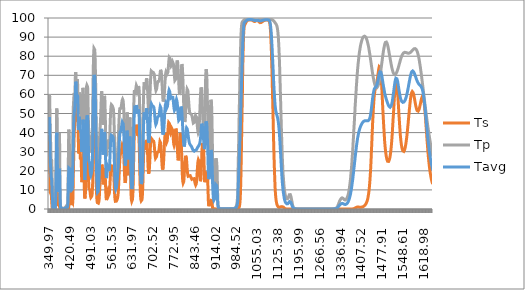
| Category | Ts | Tp | Tavg |
|---|---|---|---|
| 349.97 | 31.555 | 46.765 | 39.16 |
| 350.48 | 37.122 | 53.475 | 45.298 |
| 350.99 | 38.547 | 57.639 | 48.093 |
| 351.5 | 35.73 | 60.073 | 47.901 |
| 352.01 | 29.308 | 58.875 | 44.091 |
| 352.52 | 21.343 | 54.514 | 37.928 |
| 353.02 | 14.359 | 49.915 | 32.137 |
| 353.53 | 10.416 | 45.183 | 27.799 |
| 354.03 | 8.699 | 41.356 | 25.027 |
| 354.53 | 8.532 | 38.668 | 23.6 |
| 355.03 | 8.548 | 36.573 | 22.561 |
| 355.53 | 8.332 | 33.841 | 21.086 |
| 356.03 | 8.072 | 30.277 | 19.175 |
| 356.52 | 7.842 | 27.331 | 17.587 |
| 357.01 | 8.133 | 25.373 | 16.753 |
| 357.51 | 8.057 | 25.013 | 16.535 |
| 358.0 | 7.152 | 25.956 | 16.554 |
| 358.49 | 5.267 | 26.065 | 15.666 |
| 358.97 | 3.735 | 25.109 | 14.422 |
| 359.46 | 2.574 | 22.193 | 12.384 |
| 360.06 | 1.526 | 17.825 | 9.675 |
| 360.55 | 0.421 | 15.466 | 7.944 |
| 361.03 | 0.038 | 13.141 | 6.59 |
| 361.5 | 0.077 | 10.156 | 5.116 |
| 361.98 | 0.077 | 6.188 | 3.133 |
| 362.46 | 0 | 2.553 | 1.276 |
| 363.05 | 0.078 | 0.885 | 0.481 |
| 363.52 | 0.196 | 0.926 | 0.561 |
| 363.98 | 0 | 0.713 | 0.356 |
| 364.45 | 0.237 | 1.134 | 0.686 |
| 365.03 | 0 | 0.93 | 0.465 |
| 365.49 | 0.078 | 1.048 | 0.563 |
| 365.95 | 0.118 | 0.839 | 0.479 |
| 366.53 | 0.156 | 0.754 | 0.455 |
| 366.98 | 0.078 | 0.292 | 0.185 |
| 367.55 | 0.158 | 0.419 | 0.288 |
| 368.0 | 0.198 | 0.381 | 0.29 |
| 368.45 | 0.281 | 0.38 | 0.331 |
| 369.01 | 0.161 | 0.428 | 0.295 |
| 369.46 | 0 | 0.348 | 0.174 |
| 370.01 | 0.082 | 0.219 | 0.151 |
| 370.45 | 0.207 | 0.571 | 0.389 |
| 371.0 | 0.415 | 1.188 | 0.802 |
| 371.55 | 0 | 2.389 | 1.194 |
| 371.98 | 0.622 | 4.613 | 2.618 |
| 372.52 | 2.004 | 8.73 | 5.367 |
| 372.95 | 3.974 | 13.245 | 8.61 |
| 373.49 | 7.812 | 20.217 | 14.014 |
| 374.02 | 13.122 | 28.283 | 20.702 |
| 374.45 | 18.056 | 34.918 | 26.487 |
| 374.98 | 23.343 | 42.22 | 32.782 |
| 375.51 | 27.683 | 48.941 | 38.312 |
| 376.03 | 27.264 | 52.609 | 39.936 |
| 376.45 | 24.763 | 53.101 | 38.932 |
| 376.97 | 19.817 | 50.474 | 35.145 |
| 377.49 | 14.314 | 45.819 | 30.066 |
| 378.01 | 9.13 | 39.41 | 24.27 |
| 378.52 | 6.122 | 34.554 | 20.338 |
| 379.04 | 5.024 | 32.013 | 18.518 |
| 379.55 | 4.883 | 31.921 | 18.402 |
| 379.96 | 4.658 | 32.06 | 18.359 |
| 380.47 | 3.653 | 31.039 | 17.346 |
| 380.97 | 2.115 | 27.819 | 14.967 |
| 381.48 | 1.475 | 22.08 | 11.777 |
| 381.98 | 1.959 | 16.149 | 9.054 |
| 382.49 | 2.841 | 14.426 | 8.633 |
| 382.99 | 3.679 | 17.616 | 10.648 |
| 383.49 | 4.005 | 24.229 | 14.117 |
| 383.99 | 4.33 | 30.85 | 17.59 |
| 384.49 | 3.685 | 36.727 | 20.206 |
| 384.99 | 2.432 | 39.677 | 21.055 |
| 385.49 | 1.305 | 37.395 | 19.35 |
| 385.99 | 0.532 | 31.058 | 15.795 |
| 386.49 | 0.261 | 22.943 | 11.602 |
| 386.99 | 0.102 | 15.381 | 7.741 |
| 387.49 | 0 | 9.008 | 4.504 |
| 387.99 | 0.148 | 4.719 | 2.434 |
| 388.48 | 0.145 | 2.338 | 1.242 |
| 388.98 | 0.095 | 1.389 | 0.742 |
| 389.48 | 0 | 1.083 | 0.541 |
| 389.98 | 0 | 0.738 | 0.369 |
| 390.49 | 0 | 0.592 | 0.296 |
| 390.99 | 0 | 0.672 | 0.336 |
| 391.49 | 0.044 | 0.616 | 0.33 |
| 392.0 | 0 | 0.695 | 0.347 |
| 392.5 | 0 | 0.726 | 0.363 |
| 393.01 | 0 | 0.673 | 0.336 |
| 393.51 | 0.041 | 0.618 | 0.329 |
| 394.02 | 0 | 0.609 | 0.304 |
| 394.54 | 0.04 | 0.32 | 0.18 |
| 395.05 | 0 | 0.237 | 0.119 |
| 395.46 | 0.116 | 0.156 | 0.136 |
| 395.97 | 0.038 | 0.077 | 0.058 |
| 396.49 | 0 | 0.076 | 0.038 |
| 397.01 | 0.037 | 0 | 0.019 |
| 397.53 | 0 | 0.037 | 0.018 |
| 397.95 | 0.072 | 0.073 | 0.073 |
| 398.48 | 0 | 0.108 | 0.054 |
| 399.01 | 0.035 | 0.071 | 0.053 |
| 399.54 | 0.069 | 0.104 | 0.087 |
| 399.96 | 0.034 | 0.035 | 0.034 |
| 400.5 | 0 | 0.136 | 0.068 |
| 401.04 | 0 | 0.168 | 0.084 |
| 401.47 | 0.066 | 0.199 | 0.133 |
| 402.01 | 0.033 | 0.426 | 0.229 |
| 402.45 | 0 | 0.65 | 0.325 |
| 402.99 | 0 | 0.704 | 0.352 |
| 403.54 | 0.063 | 0.759 | 0.411 |
| 403.99 | 0.062 | 0.844 | 0.453 |
| 404.54 | 0 | 0.896 | 0.448 |
| 404.99 | 0 | 0.827 | 0.413 |
| 405.55 | 0.03 | 0.816 | 0.423 |
| 406.0 | 0 | 0.81 | 0.405 |
| 406.45 | 0.059 | 0.86 | 0.46 |
| 407.02 | 0.088 | 1.201 | 0.644 |
| 407.48 | 0.029 | 1.362 | 0.695 |
| 408.05 | 0.057 | 1.634 | 0.846 |
| 408.51 | 0 | 1.813 | 0.906 |
| 408.97 | 0.057 | 1.826 | 0.941 |
| 409.55 | 0.056 | 1.751 | 0.903 |
| 410.02 | 0.111 | 1.538 | 0.824 |
| 410.49 | 0.082 | 1.281 | 0.681 |
| 410.96 | 0.081 | 1.081 | 0.581 |
| 411.55 | 0.108 | 0.936 | 0.522 |
| 412.03 | 0.053 | 0.955 | 0.504 |
| 412.5 | 0.132 | 1.341 | 0.736 |
| 412.98 | 0.026 | 2.502 | 1.264 |
| 413.46 | 0.052 | 4.976 | 2.514 |
| 413.94 | 0.026 | 9.162 | 4.594 |
| 414.55 | 0 | 16.143 | 8.071 |
| 415.04 | 0.101 | 22.319 | 11.21 |
| 415.52 | 0.1 | 28.502 | 14.301 |
| 416.01 | 0.15 | 34.489 | 17.319 |
| 416.5 | 0.566 | 39.412 | 19.989 |
| 417.0 | 1.46 | 41.551 | 21.506 |
| 417.49 | 2.88 | 40.575 | 21.727 |
| 417.99 | 4.699 | 38.09 | 21.394 |
| 418.48 | 6.831 | 35.322 | 21.076 |
| 418.98 | 8.966 | 33.219 | 21.093 |
| 419.48 | 10.603 | 31.81 | 21.207 |
| 419.98 | 11.187 | 31.249 | 21.218 |
| 420.49 | 11.01 | 31.06 | 21.035 |
| 420.99 | 10.71 | 30.596 | 20.653 |
| 421.5 | 10.425 | 29.83 | 20.128 |
| 422.0 | 9.825 | 27.83 | 18.827 |
| 422.51 | 8.871 | 24.731 | 16.801 |
| 423.02 | 8.275 | 20.774 | 14.525 |
| 423.53 | 7.784 | 17.401 | 12.593 |
| 424.04 | 6.671 | 15.779 | 11.225 |
| 424.55 | 4.848 | 16.081 | 10.464 |
| 425.06 | 2.924 | 16.993 | 9.958 |
| 425.45 | 2.053 | 17.617 | 9.835 |
| 425.96 | 1.933 | 18 | 9.967 |
| 426.48 | 2.523 | 17.816 | 10.169 |
| 426.99 | 3.167 | 17.051 | 10.109 |
| 427.51 | 3.605 | 15.86 | 9.732 |
| 428.03 | 3.971 | 15.33 | 9.651 |
| 428.54 | 4.024 | 16.726 | 10.375 |
| 429.06 | 3.9 | 21.034 | 12.467 |
| 429.45 | 3.557 | 25.578 | 14.568 |
| 429.97 | 3.345 | 32.49 | 17.918 |
| 430.49 | 4.19 | 39.065 | 21.628 |
| 431.01 | 6.716 | 44.531 | 25.623 |
| 431.52 | 11.078 | 49.271 | 30.174 |
| 432.04 | 16.134 | 52.738 | 34.436 |
| 432.56 | 20.597 | 54.916 | 37.757 |
| 432.95 | 23.87 | 55.93 | 39.9 |
| 433.47 | 28.164 | 57.236 | 42.7 |
| 433.99 | 32.184 | 58.677 | 45.431 |
| 434.51 | 35.7 | 59.91 | 47.805 |
| 435.03 | 38.227 | 60.815 | 49.521 |
| 435.55 | 40.569 | 60.869 | 50.719 |
| 435.94 | 42.415 | 60.222 | 51.318 |
| 436.46 | 44.717 | 59.342 | 52.029 |
| 436.97 | 46.498 | 59.096 | 52.797 |
| 437.49 | 47.134 | 60.457 | 53.795 |
| 438.01 | 47.259 | 63.044 | 55.151 |
| 438.52 | 48.177 | 66.286 | 57.232 |
| 439.04 | 50.82 | 68.992 | 59.906 |
| 439.55 | 54.738 | 71.039 | 62.888 |
| 439.94 | 58.034 | 71.672 | 64.853 |
| 440.45 | 61.979 | 71.345 | 66.662 |
| 440.96 | 64.14 | 69.954 | 67.047 |
| 441.48 | 63.903 | 68.017 | 65.96 |
| 441.99 | 61.558 | 66.223 | 63.891 |
| 442.5 | 57.722 | 64.765 | 61.244 |
| 443.0 | 53.382 | 63.768 | 58.575 |
| 443.51 | 49.429 | 63.464 | 56.446 |
| 444.02 | 46.617 | 64.146 | 55.381 |
| 444.52 | 45.84 | 65.518 | 55.679 |
| 445.03 | 46.888 | 67.051 | 56.969 |
| 445.53 | 49.186 | 68.033 | 58.61 |
| 446.03 | 51.474 | 68.087 | 59.78 |
| 446.53 | 53.012 | 66.67 | 59.841 |
| 447.03 | 52.898 | 63.958 | 58.428 |
| 447.52 | 51.059 | 60.103 | 55.581 |
| 448.02 | 47.392 | 55.892 | 51.642 |
| 448.51 | 42.458 | 52.196 | 47.327 |
| 449.0 | 37.073 | 50.127 | 43.6 |
| 449.49 | 32.765 | 50.121 | 41.443 |
| 449.98 | 29.982 | 52 | 40.991 |
| 450.47 | 29.084 | 54.792 | 41.938 |
| 450.96 | 29.93 | 57.642 | 43.786 |
| 451.56 | 32.246 | 60.214 | 46.23 |
| 452.04 | 34.24 | 61.015 | 47.627 |
| 452.52 | 35.803 | 60.786 | 48.294 |
| 453.0 | 36.491 | 59.471 | 47.981 |
| 453.48 | 36.205 | 57.715 | 46.96 |
| 453.95 | 34.874 | 55.898 | 45.386 |
| 454.54 | 32.138 | 54.57 | 43.354 |
| 455.01 | 29.506 | 54.413 | 41.96 |
| 455.48 | 27.466 | 54.907 | 41.186 |
| 456.06 | 26.2 | 55.672 | 40.936 |
| 456.52 | 26.309 | 56.011 | 41.16 |
| 456.99 | 26.689 | 55.651 | 41.17 |
| 457.45 | 26.939 | 54.783 | 40.861 |
| 458.02 | 26.643 | 52.641 | 39.642 |
| 458.47 | 25.732 | 50.494 | 38.113 |
| 459.04 | 23.617 | 47.527 | 35.572 |
| 459.49 | 21.271 | 45.594 | 33.433 |
| 460.05 | 17.856 | 44.304 | 31.08 |
| 460.5 | 15.532 | 44.374 | 29.953 |
| 460.95 | 14.064 | 45.412 | 29.738 |
| 461.5 | 13.662 | 47.832 | 30.747 |
| 462.05 | 14.767 | 51.078 | 32.923 |
| 462.49 | 16.527 | 53.905 | 35.216 |
| 463.04 | 19.312 | 57.258 | 38.285 |
| 463.47 | 21.832 | 59.696 | 40.764 |
| 464.01 | 25.037 | 62.109 | 43.573 |
| 464.55 | 28.018 | 63.426 | 45.722 |
| 464.98 | 29.874 | 63.63 | 46.752 |
| 465.51 | 31.137 | 62.715 | 46.926 |
| 466.04 | 30.979 | 60.68 | 45.83 |
| 466.47 | 29.759 | 58.218 | 43.989 |
| 466.99 | 27.347 | 54.212 | 40.78 |
| 467.52 | 24.055 | 49.52 | 36.788 |
| 468.04 | 20.414 | 44.487 | 32.45 |
| 468.46 | 17.214 | 40.522 | 28.868 |
| 468.97 | 13.339 | 35.687 | 24.513 |
| 469.49 | 9.998 | 31.289 | 20.643 |
| 470.0 | 7.611 | 27.989 | 17.8 |
| 470.52 | 6.184 | 25.856 | 16.02 |
| 471.03 | 5.514 | 24.901 | 15.207 |
| 471.54 | 5.458 | 25.134 | 15.296 |
| 472.04 | 5.866 | 26.638 | 16.252 |
| 472.55 | 6.694 | 29.31 | 18.002 |
| 473.05 | 7.995 | 33.182 | 20.589 |
| 473.46 | 9.333 | 36.881 | 23.107 |
| 473.96 | 11.477 | 42.28 | 26.879 |
| 474.46 | 14.078 | 47.737 | 30.908 |
| 474.96 | 16.924 | 52.773 | 34.848 |
| 475.46 | 20.061 | 57.025 | 38.543 |
| 475.96 | 23.17 | 60.381 | 41.775 |
| 476.46 | 25.948 | 62.693 | 44.32 |
| 477.05 | 28.65 | 64.183 | 46.416 |
| 477.55 | 30.302 | 64.653 | 47.477 |
| 478.05 | 31.601 | 64.82 | 48.211 |
| 478.54 | 32.351 | 64.911 | 48.631 |
| 479.04 | 32.826 | 65.194 | 49.01 |
| 479.54 | 33.033 | 65.272 | 49.152 |
| 480.03 | 32.836 | 65.09 | 48.963 |
| 480.53 | 32.074 | 63.983 | 48.028 |
| 481.03 | 30.745 | 62.032 | 46.388 |
| 481.53 | 28.915 | 59.083 | 43.999 |
| 482.03 | 26.533 | 55.392 | 40.962 |
| 482.52 | 23.631 | 51.3 | 37.466 |
| 483.03 | 20.33 | 47.193 | 33.761 |
| 483.53 | 16.837 | 43.64 | 30.238 |
| 484.03 | 13.9 | 41.114 | 27.507 |
| 484.53 | 11.88 | 39.552 | 25.716 |
| 485.04 | 10.697 | 38.908 | 24.802 |
| 485.55 | 10.237 | 38.857 | 24.547 |
| 486.05 | 10.195 | 38.919 | 24.557 |
| 486.46 | 10.294 | 38.946 | 24.62 |
| 486.97 | 10.396 | 38.66 | 24.528 |
| 487.49 | 10.353 | 37.878 | 24.116 |
| 488.0 | 10.044 | 36.648 | 23.346 |
| 488.52 | 9.545 | 35.054 | 22.3 |
| 489.04 | 8.825 | 33.259 | 21.042 |
| 489.45 | 8.122 | 31.934 | 20.028 |
| 489.97 | 7.266 | 30.555 | 18.91 |
| 490.5 | 6.613 | 29.606 | 18.109 |
| 491.03 | 6.184 | 29.174 | 17.679 |
| 491.45 | 6.028 | 29.131 | 17.58 |
| 491.98 | 5.97 | 29.403 | 17.686 |
| 492.52 | 6.045 | 29.837 | 17.941 |
| 493.05 | 6.188 | 30.436 | 18.312 |
| 493.49 | 6.362 | 30.978 | 18.67 |
| 494.03 | 6.519 | 31.712 | 19.116 |
| 494.46 | 6.693 | 32.454 | 19.574 |
| 495.01 | 6.999 | 33.683 | 20.341 |
| 495.45 | 7.324 | 35.088 | 21.206 |
| 496.0 | 8.037 | 37.586 | 22.812 |
| 496.56 | 9.251 | 41.155 | 25.203 |
| 497.0 | 10.839 | 44.843 | 27.841 |
| 497.45 | 13.201 | 49.134 | 31.167 |
| 498.01 | 17.517 | 55.277 | 36.397 |
| 498.46 | 22.014 | 60.353 | 41.184 |
| 499.03 | 28.234 | 66.676 | 47.455 |
| 499.49 | 33.446 | 71.297 | 52.372 |
| 499.95 | 38.484 | 75.302 | 56.893 |
| 500.52 | 44.158 | 79.18 | 61.669 |
| 500.98 | 48.222 | 81.453 | 64.838 |
| 501.45 | 51.725 | 82.99 | 67.357 |
| 502.03 | 54.769 | 84.142 | 69.456 |
| 502.5 | 56.017 | 84.377 | 70.197 |
| 502.97 | 56.459 | 84.538 | 70.499 |
| 503.56 | 56.179 | 84.373 | 70.276 |
| 504.03 | 55.527 | 84.025 | 69.776 |
| 504.51 | 54.51 | 83.454 | 68.982 |
| 504.99 | 52.98 | 82.412 | 67.696 |
| 505.47 | 50.636 | 80.932 | 65.784 |
| 505.95 | 47.441 | 78.834 | 63.138 |
| 506.55 | 42.424 | 75.31 | 58.867 |
| 507.04 | 37.744 | 71.728 | 54.736 |
| 507.53 | 32.921 | 67.526 | 50.224 |
| 508.02 | 28.212 | 62.809 | 45.511 |
| 508.51 | 23.773 | 57.704 | 40.739 |
| 509.0 | 19.644 | 52.288 | 35.966 |
| 509.49 | 15.974 | 46.705 | 31.34 |
| 509.99 | 12.694 | 41.086 | 26.89 |
| 510.48 | 10.008 | 35.691 | 22.85 |
| 510.98 | 7.79 | 30.713 | 19.252 |
| 511.48 | 6.217 | 26.29 | 16.253 |
| 511.98 | 5.032 | 22.561 | 13.796 |
| 512.48 | 4.214 | 19.538 | 11.876 |
| 512.99 | 3.716 | 17.227 | 10.471 |
| 513.49 | 3.319 | 15.566 | 9.442 |
| 514.0 | 3.078 | 14.453 | 8.766 |
| 514.5 | 2.947 | 13.887 | 8.417 |
| 515.01 | 2.872 | 13.693 | 8.283 |
| 515.52 | 2.876 | 13.945 | 8.41 |
| 516.03 | 2.871 | 14.601 | 8.736 |
| 516.54 | 2.916 | 15.713 | 9.315 |
| 517.05 | 3.038 | 17.228 | 10.133 |
| 517.56 | 3.223 | 19.256 | 11.24 |
| 517.95 | 3.409 | 21.023 | 12.216 |
| 518.46 | 3.733 | 23.706 | 13.719 |
| 518.97 | 4.241 | 26.657 | 15.449 |
| 519.49 | 4.977 | 29.601 | 17.289 |
| 520.0 | 5.929 | 32.427 | 19.178 |
| 520.52 | 7.217 | 35.002 | 21.11 |
| 521.04 | 8.767 | 37.321 | 23.044 |
| 521.55 | 10.384 | 39.179 | 24.781 |
| 521.94 | 11.599 | 40.397 | 25.998 |
| 522.46 | 13.096 | 41.738 | 27.417 |
| 522.98 | 14.352 | 42.92 | 28.636 |
| 523.49 | 15.409 | 44.134 | 29.771 |
| 524.01 | 16.168 | 45.609 | 30.889 |
| 524.53 | 16.667 | 47.406 | 32.036 |
| 525.05 | 16.979 | 49.794 | 33.386 |
| 525.56 | 17.3 | 52.539 | 34.92 |
| 525.95 | 17.667 | 54.557 | 36.112 |
| 526.47 | 18.506 | 57.294 | 37.9 |
| 526.98 | 19.707 | 59.496 | 39.601 |
| 527.5 | 21.147 | 61.02 | 41.083 |
| 528.02 | 22.29 | 61.622 | 41.956 |
| 528.53 | 23.21 | 61.112 | 42.161 |
| 529.05 | 23.622 | 59.904 | 41.763 |
| 529.56 | 23.651 | 57.674 | 40.663 |
| 529.95 | 23.179 | 55.555 | 39.367 |
| 530.46 | 22.082 | 52.415 | 37.248 |
| 530.98 | 20.281 | 49.418 | 34.85 |
| 531.49 | 18.08 | 46.849 | 32.465 |
| 532.0 | 15.895 | 45.023 | 30.459 |
| 532.51 | 14.053 | 44.102 | 29.078 |
| 533.02 | 12.892 | 44.073 | 28.483 |
| 533.53 | 12.467 | 44.781 | 28.624 |
| 534.04 | 12.645 | 46.086 | 29.366 |
| 534.54 | 13.3 | 47.917 | 30.608 |
| 535.05 | 14.352 | 50.027 | 32.19 |
| 535.55 | 15.704 | 52.342 | 34.023 |
| 536.05 | 17.26 | 54.587 | 35.923 |
| 536.56 | 18.881 | 56.677 | 37.779 |
| 537.06 | 20.341 | 58.289 | 39.315 |
| 537.56 | 21.388 | 59.205 | 40.296 |
| 538.05 | 21.906 | 59.379 | 40.642 |
| 538.55 | 21.901 | 58.67 | 40.285 |
| 539.04 | 21.213 | 57.004 | 39.108 |
| 539.54 | 20.028 | 54.563 | 37.295 |
| 540.03 | 18.342 | 51.496 | 34.919 |
| 540.52 | 16.28 | 47.896 | 32.088 |
| 541.01 | 13.956 | 44.041 | 28.998 |
| 541.49 | 11.598 | 40.245 | 25.922 |
| 541.98 | 9.417 | 36.647 | 23.032 |
| 542.46 | 7.69 | 33.461 | 20.575 |
| 543.06 | 6.138 | 30.425 | 18.282 |
| 543.54 | 5.32 | 28.729 | 17.024 |
| 544.02 | 4.867 | 27.723 | 16.295 |
| 544.5 | 4.679 | 27.388 | 16.033 |
| 544.97 | 4.696 | 27.678 | 16.187 |
| 545.56 | 5.083 | 28.669 | 16.876 |
| 546.03 | 5.586 | 29.978 | 17.782 |
| 546.5 | 6.225 | 31.423 | 18.824 |
| 546.97 | 6.98 | 32.931 | 19.956 |
| 547.55 | 7.888 | 34.585 | 21.237 |
| 548.01 | 8.517 | 35.654 | 22.085 |
| 548.47 | 9.081 | 36.309 | 22.695 |
| 549.04 | 9.474 | 36.649 | 23.062 |
| 549.5 | 9.66 | 36.413 | 23.036 |
| 549.95 | 9.616 | 35.904 | 22.76 |
| 550.51 | 9.354 | 34.925 | 22.139 |
| 550.96 | 8.951 | 33.933 | 21.442 |
| 551.52 | 8.373 | 32.744 | 20.559 |
| 551.97 | 7.971 | 31.94 | 19.956 |
| 552.52 | 7.586 | 31.387 | 19.487 |
| 552.96 | 7.527 | 31.364 | 19.445 |
| 553.51 | 7.718 | 31.815 | 19.767 |
| 553.95 | 8.149 | 32.653 | 20.401 |
| 554.49 | 8.965 | 34.154 | 21.559 |
| 555.03 | 10.052 | 36.172 | 23.112 |
| 555.46 | 11.108 | 37.961 | 24.534 |
| 556.0 | 12.562 | 40.453 | 26.507 |
| 556.53 | 14.106 | 42.96 | 28.533 |
| 556.96 | 15.372 | 44.917 | 30.144 |
| 557.48 | 16.844 | 47.179 | 32.011 |
| 558.01 | 18.23 | 49.219 | 33.724 |
| 558.53 | 19.5 | 50.886 | 35.193 |
| 558.95 | 20.333 | 52.056 | 36.194 |
| 559.47 | 21.234 | 53.081 | 37.157 |
| 559.99 | 21.89 | 53.867 | 37.878 |
| 560.5 | 22.356 | 54.349 | 38.353 |
| 561.02 | 22.616 | 54.629 | 38.622 |
| 561.53 | 22.77 | 54.745 | 38.758 |
| 562.04 | 22.845 | 54.753 | 38.799 |
| 562.55 | 22.782 | 54.655 | 38.718 |
| 563.05 | 22.768 | 54.479 | 38.624 |
| 563.46 | 22.675 | 54.3 | 38.487 |
| 563.96 | 22.631 | 54.094 | 38.363 |
| 564.46 | 22.55 | 53.831 | 38.191 |
| 564.96 | 22.505 | 53.603 | 38.054 |
| 565.46 | 22.47 | 53.425 | 37.948 |
| 565.96 | 22.43 | 53.251 | 37.841 |
| 566.46 | 22.275 | 53.092 | 37.683 |
| 567.05 | 21.876 | 52.901 | 37.388 |
| 567.55 | 21.313 | 52.576 | 36.944 |
| 568.04 | 20.546 | 51.994 | 36.27 |
| 568.54 | 19.506 | 51.081 | 35.294 |
| 569.03 | 18.307 | 49.74 | 34.023 |
| 569.53 | 16.868 | 47.856 | 32.362 |
| 570.02 | 15.252 | 45.528 | 30.39 |
| 570.51 | 13.398 | 42.876 | 28.137 |
| 571.01 | 11.458 | 39.768 | 25.613 |
| 571.5 | 9.551 | 36.405 | 22.978 |
| 572.0 | 7.895 | 32.994 | 20.445 |
| 572.49 | 6.522 | 29.568 | 18.045 |
| 572.99 | 5.531 | 26.459 | 15.995 |
| 573.48 | 4.812 | 23.781 | 14.296 |
| 573.98 | 4.314 | 21.489 | 12.901 |
| 574.48 | 4.021 | 19.675 | 11.848 |
| 574.98 | 3.815 | 18.395 | 11.105 |
| 575.48 | 3.69 | 17.519 | 10.605 |
| 575.98 | 3.692 | 17.041 | 10.366 |
| 576.48 | 3.729 | 16.93 | 10.329 |
| 576.99 | 3.822 | 17.099 | 10.46 |
| 577.49 | 3.918 | 17.55 | 10.734 |
| 578.0 | 4.1 | 18.261 | 11.18 |
| 578.51 | 4.231 | 19.187 | 11.709 |
| 579.02 | 4.413 | 20.362 | 12.388 |
| 579.53 | 4.604 | 21.588 | 13.096 |
| 580.05 | 4.799 | 23.006 | 13.902 |
| 580.46 | 4.948 | 24.185 | 14.566 |
| 580.98 | 5.177 | 25.681 | 15.429 |
| 581.5 | 5.453 | 27.262 | 16.358 |
| 582.03 | 5.772 | 28.783 | 17.278 |
| 582.55 | 6.189 | 30.437 | 18.313 |
| 582.97 | 6.604 | 31.781 | 19.192 |
| 583.5 | 7.28 | 33.521 | 20.401 |
| 584.04 | 8.193 | 35.421 | 21.807 |
| 584.46 | 9.054 | 36.976 | 23.015 |
| 585.0 | 10.365 | 38.978 | 24.671 |
| 585.54 | 11.98 | 41.085 | 26.532 |
| 585.98 | 13.466 | 42.761 | 28.113 |
| 586.52 | 15.439 | 44.911 | 30.175 |
| 586.96 | 17.093 | 46.496 | 31.794 |
| 587.51 | 19.252 | 48.421 | 33.836 |
| 587.95 | 20.87 | 49.669 | 35.27 |
| 588.51 | 22.74 | 51.058 | 36.899 |
| 588.95 | 24.115 | 51.884 | 37.999 |
| 589.52 | 25.588 | 52.546 | 39.067 |
| 589.97 | 26.579 | 52.896 | 39.738 |
| 590.53 | 27.586 | 53.067 | 40.327 |
| 590.99 | 28.124 | 52.979 | 40.551 |
| 591.56 | 28.539 | 52.833 | 40.686 |
| 592.02 | 28.798 | 52.71 | 40.754 |
| 592.48 | 28.981 | 52.646 | 40.814 |
| 593.06 | 29.223 | 52.707 | 40.965 |
| 593.52 | 29.517 | 52.901 | 41.209 |
| 593.99 | 29.904 | 53.165 | 41.535 |
| 594.46 | 30.287 | 53.639 | 41.963 |
| 595.05 | 30.888 | 54.287 | 42.587 |
| 595.52 | 31.4 | 54.84 | 43.12 |
| 596.0 | 31.927 | 55.392 | 43.659 |
| 596.47 | 32.394 | 55.93 | 44.162 |
| 596.95 | 32.882 | 56.418 | 44.65 |
| 597.55 | 33.37 | 56.951 | 45.16 |
| 598.04 | 33.677 | 57.285 | 45.481 |
| 598.52 | 33.862 | 57.41 | 45.636 |
| 599.01 | 34.005 | 57.52 | 45.763 |
| 599.49 | 34.032 | 57.515 | 45.774 |
| 599.98 | 33.855 | 57.351 | 45.603 |
| 600.47 | 33.452 | 56.976 | 45.214 |
| 600.96 | 32.791 | 56.39 | 44.59 |
| 601.46 | 31.943 | 55.57 | 43.756 |
| 601.95 | 30.82 | 54.454 | 42.637 |
| 602.45 | 29.471 | 53.049 | 41.26 |
| 602.95 | 27.879 | 51.377 | 39.628 |
| 603.45 | 26.102 | 49.352 | 37.727 |
| 603.95 | 24.192 | 47.152 | 35.672 |
| 604.45 | 22.143 | 44.856 | 33.499 |
| 604.95 | 20.173 | 42.39 | 31.282 |
| 605.45 | 18.334 | 39.889 | 29.112 |
| 605.96 | 16.684 | 37.644 | 27.164 |
| 606.46 | 15.334 | 35.639 | 25.486 |
| 606.97 | 14.278 | 33.933 | 24.106 |
| 607.48 | 13.665 | 32.698 | 23.181 |
| 607.99 | 13.353 | 32.052 | 22.702 |
| 608.5 | 13.49 | 31.79 | 22.64 |
| 609.01 | 14.057 | 32.262 | 23.159 |
| 609.52 | 15.127 | 33.216 | 24.172 |
| 610.03 | 16.736 | 34.871 | 25.803 |
| 610.54 | 18.854 | 37.009 | 27.931 |
| 611.06 | 21.321 | 39.556 | 30.438 |
| 611.44 | 23.201 | 41.53 | 32.366 |
| 611.95 | 25.704 | 44.243 | 34.974 |
| 612.47 | 27.879 | 46.658 | 37.269 |
| 612.98 | 29.57 | 48.499 | 39.035 |
| 613.5 | 30.732 | 49.932 | 40.332 |
| 614.01 | 31.391 | 50.599 | 40.995 |
| 614.53 | 31.507 | 50.589 | 41.048 |
| 615.04 | 31.013 | 49.892 | 40.452 |
| 615.56 | 29.93 | 48.448 | 39.189 |
| 615.95 | 28.521 | 46.934 | 37.728 |
| 616.46 | 26.232 | 44.549 | 35.391 |
| 616.98 | 23.602 | 41.827 | 32.714 |
| 617.49 | 20.981 | 39.26 | 30.12 |
| 618.01 | 18.945 | 36.963 | 27.954 |
| 618.52 | 17.658 | 35.39 | 26.524 |
| 619.03 | 17.352 | 34.605 | 25.978 |
| 619.55 | 18.066 | 34.727 | 26.396 |
| 620.06 | 19.766 | 35.762 | 27.764 |
| 620.45 | 21.421 | 37.108 | 29.265 |
| 620.96 | 23.813 | 39.34 | 31.576 |
| 621.47 | 25.848 | 41.854 | 33.851 |
| 621.98 | 27.253 | 44.203 | 35.728 |
| 622.49 | 28.163 | 46.088 | 37.125 |
| 623.0 | 28.503 | 47.366 | 37.934 |
| 623.51 | 28.397 | 47.921 | 38.159 |
| 624.01 | 27.705 | 47.684 | 37.694 |
| 624.52 | 26.521 | 46.636 | 36.579 |
| 625.03 | 24.57 | 44.909 | 34.74 |
| 625.53 | 21.744 | 42.329 | 32.036 |
| 626.03 | 18.204 | 39 | 28.602 |
| 626.54 | 14.435 | 35.207 | 24.821 |
| 627.04 | 10.995 | 31.168 | 21.082 |
| 627.54 | 8.362 | 27.312 | 17.837 |
| 628.04 | 6.567 | 23.954 | 15.26 |
| 628.53 | 5.439 | 21.273 | 13.356 |
| 629.03 | 4.694 | 19.28 | 11.987 |
| 629.52 | 4.224 | 17.98 | 11.102 |
| 630.02 | 4.003 | 17.239 | 10.621 |
| 630.51 | 3.876 | 17.024 | 10.45 |
| 631.0 | 3.953 | 17.313 | 10.633 |
| 631.48 | 4.127 | 18.031 | 11.079 |
| 631.97 | 4.484 | 19.337 | 11.911 |
| 632.46 | 5.016 | 21.084 | 13.05 |
| 633.06 | 6.051 | 24.073 | 15.062 |
| 633.54 | 7.286 | 27.126 | 17.206 |
| 634.02 | 9.011 | 30.612 | 19.812 |
| 634.5 | 11.335 | 34.497 | 22.916 |
| 634.97 | 14.256 | 38.64 | 26.448 |
| 635.45 | 17.664 | 42.763 | 30.214 |
| 636.04 | 22.141 | 47.604 | 34.873 |
| 636.51 | 25.768 | 51.16 | 38.464 |
| 636.98 | 29.155 | 54.383 | 41.769 |
| 637.56 | 32.977 | 57.623 | 45.3 |
| 638.02 | 35.692 | 59.711 | 47.701 |
| 638.48 | 37.999 | 61.112 | 49.555 |
| 639.06 | 40.334 | 62.253 | 51.294 |
| 639.52 | 41.657 | 62.624 | 52.14 |
| 639.97 | 42.463 | 62.548 | 52.505 |
| 640.54 | 42.795 | 62.186 | 52.491 |
| 640.99 | 42.552 | 61.801 | 52.177 |
| 641.55 | 42.027 | 61.409 | 51.718 |
| 642.0 | 41.624 | 61.305 | 51.465 |
| 642.55 | 41.409 | 61.467 | 51.438 |
| 643.0 | 41.577 | 61.834 | 51.705 |
| 643.55 | 42.193 | 62.454 | 52.324 |
| 643.99 | 42.702 | 63.051 | 52.877 |
| 644.53 | 43.395 | 63.786 | 53.59 |
| 644.97 | 43.81 | 64.275 | 54.043 |
| 645.51 | 44.116 | 64.694 | 54.405 |
| 646.05 | 44.115 | 64.873 | 54.494 |
| 646.47 | 43.877 | 64.773 | 54.325 |
| 647.01 | 43.314 | 64.504 | 53.909 |
| 647.54 | 42.386 | 63.951 | 53.168 |
| 647.96 | 41.531 | 63.377 | 52.454 |
| 648.48 | 40.321 | 62.65 | 51.486 |
| 649.01 | 39.239 | 61.869 | 50.554 |
| 649.53 | 38.423 | 61.287 | 49.855 |
| 650.05 | 38.134 | 61.016 | 49.575 |
| 650.46 | 38.253 | 60.984 | 49.619 |
| 650.97 | 38.715 | 61.32 | 50.017 |
| 651.49 | 39.387 | 61.944 | 50.665 |
| 652.0 | 39.979 | 62.757 | 51.368 |
| 652.51 | 40.092 | 63.538 | 51.815 |
| 653.01 | 39.811 | 64.262 | 52.037 |
| 653.52 | 39.12 | 64.564 | 51.842 |
| 654.02 | 38.007 | 64.33 | 51.168 |
| 654.52 | 36.522 | 63.642 | 50.082 |
| 655.02 | 34.464 | 62.326 | 48.395 |
| 655.52 | 32.047 | 60.438 | 46.243 |
| 656.02 | 29.001 | 57.954 | 43.477 |
| 656.51 | 25.491 | 54.977 | 40.234 |
| 657.01 | 21.699 | 51.5 | 36.599 |
| 657.5 | 17.84 | 47.624 | 32.732 |
| 658.0 | 14.327 | 43.497 | 28.912 |
| 658.49 | 11.448 | 39.547 | 25.498 |
| 658.98 | 9.232 | 35.645 | 22.438 |
| 659.47 | 7.567 | 32.058 | 19.812 |
| 659.96 | 6.38 | 28.997 | 17.688 |
| 660.55 | 5.424 | 26.089 | 15.757 |
| 661.04 | 4.875 | 24.221 | 14.548 |
| 661.53 | 4.524 | 22.839 | 13.681 |
| 662.03 | 4.274 | 21.908 | 13.091 |
| 662.52 | 4.168 | 21.421 | 12.794 |
| 663.01 | 4.179 | 21.314 | 12.746 |
| 663.5 | 4.294 | 21.594 | 12.944 |
| 663.99 | 4.476 | 22.313 | 13.394 |
| 664.49 | 4.817 | 23.394 | 14.105 |
| 664.98 | 5.359 | 25.007 | 15.183 |
| 665.48 | 6.088 | 27.089 | 16.589 |
| 665.97 | 7.088 | 29.514 | 18.301 |
| 666.47 | 8.471 | 32.539 | 20.505 |
| 666.97 | 10.274 | 36.078 | 23.176 |
| 667.47 | 12.607 | 39.927 | 26.267 |
| 667.97 | 15.374 | 43.944 | 29.659 |
| 668.47 | 18.395 | 47.941 | 33.168 |
| 668.98 | 21.639 | 52.051 | 36.845 |
| 669.48 | 24.714 | 55.827 | 40.27 |
| 669.99 | 27.458 | 59.028 | 43.243 |
| 670.5 | 29.965 | 61.741 | 45.853 |
| 671.01 | 31.947 | 63.957 | 47.952 |
| 671.53 | 33.613 | 65.526 | 49.569 |
| 672.05 | 34.733 | 66.371 | 50.552 |
| 672.46 | 35.298 | 66.619 | 50.958 |
| 672.98 | 35.41 | 66.393 | 50.902 |
| 673.5 | 34.96 | 65.757 | 50.358 |
| 674.03 | 34.064 | 64.831 | 49.447 |
| 674.45 | 33.085 | 64.082 | 48.584 |
| 674.98 | 31.858 | 63.214 | 47.536 |
| 675.52 | 30.986 | 62.661 | 46.823 |
| 676.05 | 30.584 | 62.469 | 46.527 |
| 676.48 | 30.63 | 62.63 | 46.63 |
| 677.02 | 31.282 | 63.155 | 47.218 |
| 677.46 | 32.108 | 63.834 | 47.971 |
| 678.0 | 33.307 | 64.884 | 49.095 |
| 678.55 | 34.495 | 66.055 | 50.275 |
| 678.99 | 35.373 | 66.954 | 51.163 |
| 679.54 | 36.214 | 67.864 | 52.039 |
| 679.99 | 36.574 | 68.422 | 52.498 |
| 680.55 | 36.715 | 68.715 | 52.715 |
| 681.0 | 36.474 | 68.693 | 52.584 |
| 681.45 | 35.844 | 68.253 | 52.049 |
| 682.01 | 34.709 | 67.341 | 51.025 |
| 682.47 | 33.433 | 66.193 | 49.813 |
| 683.04 | 31.409 | 64.345 | 47.877 |
| 683.5 | 29.493 | 62.617 | 46.055 |
| 683.96 | 27.518 | 60.785 | 44.151 |
| 684.54 | 24.958 | 58.385 | 41.671 |
| 685.01 | 23.084 | 56.537 | 39.811 |
| 685.47 | 21.5 | 54.791 | 38.145 |
| 686.06 | 19.889 | 52.887 | 36.388 |
| 686.53 | 19.037 | 51.721 | 35.379 |
| 687.01 | 18.489 | 50.893 | 34.691 |
| 687.48 | 18.274 | 50.432 | 34.353 |
| 687.96 | 18.371 | 50.344 | 34.358 |
| 688.56 | 18.891 | 50.719 | 34.805 |
| 689.04 | 19.636 | 51.403 | 35.519 |
| 689.52 | 20.654 | 52.41 | 36.532 |
| 690.0 | 21.86 | 53.719 | 37.79 |
| 690.49 | 23.302 | 55.27 | 39.286 |
| 690.98 | 24.879 | 56.992 | 40.936 |
| 691.46 | 26.559 | 58.963 | 42.761 |
| 691.96 | 28.303 | 60.886 | 44.595 |
| 692.45 | 29.986 | 62.853 | 46.42 |
| 693.06 | 31.949 | 65.17 | 48.56 |
| 693.56 | 33.384 | 66.861 | 50.122 |
| 694.05 | 34.685 | 68.435 | 51.56 |
| 694.55 | 35.713 | 69.75 | 52.731 |
| 695.05 | 36.582 | 70.843 | 53.712 |
| 695.55 | 37.123 | 71.662 | 54.393 |
| 696.05 | 37.478 | 72.243 | 54.86 |
| 696.55 | 37.6 | 72.563 | 55.081 |
| 697.06 | 37.491 | 72.655 | 55.073 |
| 697.56 | 37.297 | 72.582 | 54.94 |
| 697.94 | 37.087 | 72.455 | 54.771 |
| 698.44 | 36.757 | 72.196 | 54.476 |
| 698.95 | 36.418 | 71.921 | 54.17 |
| 699.46 | 36.134 | 71.642 | 53.888 |
| 699.97 | 35.945 | 71.417 | 53.681 |
| 700.48 | 35.83 | 71.281 | 53.556 |
| 700.98 | 35.789 | 71.204 | 53.497 |
| 701.49 | 35.83 | 71.241 | 53.536 |
| 702.01 | 35.889 | 71.309 | 53.599 |
| 702.52 | 35.936 | 71.396 | 53.666 |
| 703.03 | 35.908 | 71.529 | 53.719 |
| 703.54 | 35.802 | 71.635 | 53.719 |
| 704.05 | 35.568 | 71.631 | 53.599 |
| 704.56 | 35.253 | 71.542 | 53.397 |
| 704.95 | 34.919 | 71.446 | 53.182 |
| 705.46 | 34.302 | 71.077 | 52.689 |
| 705.97 | 33.6 | 70.627 | 52.114 |
| 706.49 | 32.814 | 70.008 | 51.411 |
| 707.0 | 31.901 | 69.262 | 50.582 |
| 707.51 | 30.914 | 68.402 | 49.658 |
| 708.02 | 29.96 | 67.47 | 48.715 |
| 708.54 | 28.993 | 66.537 | 47.765 |
| 709.05 | 28.218 | 65.55 | 46.884 |
| 709.56 | 27.477 | 64.662 | 46.07 |
| 709.94 | 27.034 | 64.045 | 45.539 |
| 710.45 | 26.599 | 63.358 | 44.978 |
| 710.96 | 26.3 | 62.729 | 44.514 |
| 711.47 | 26.214 | 62.276 | 44.245 |
| 711.98 | 26.232 | 62.016 | 44.124 |
| 712.49 | 26.407 | 61.946 | 44.177 |
| 713.0 | 26.7 | 62.035 | 44.368 |
| 713.5 | 27.034 | 62.313 | 44.673 |
| 714.01 | 27.477 | 62.675 | 45.076 |
| 714.52 | 27.939 | 63.146 | 45.543 |
| 715.02 | 28.364 | 63.703 | 46.033 |
| 715.52 | 28.776 | 64.269 | 46.523 |
| 716.03 | 29.117 | 64.838 | 46.977 |
| 716.53 | 29.367 | 65.415 | 47.391 |
| 717.03 | 29.586 | 65.866 | 47.726 |
| 717.52 | 29.729 | 66.243 | 47.986 |
| 718.02 | 29.765 | 66.55 | 48.157 |
| 718.52 | 29.819 | 66.757 | 48.288 |
| 719.01 | 29.787 | 66.825 | 48.306 |
| 719.51 | 29.781 | 66.868 | 48.324 |
| 720.0 | 29.787 | 66.844 | 48.315 |
| 720.49 | 29.883 | 66.779 | 48.331 |
| 720.98 | 30.043 | 66.745 | 48.394 |
| 721.46 | 30.315 | 66.718 | 48.516 |
| 721.95 | 30.681 | 66.75 | 48.715 |
| 722.56 | 31.387 | 66.908 | 49.148 |
| 723.04 | 32.037 | 67.186 | 49.612 |
| 723.52 | 32.726 | 67.551 | 50.138 |
| 724.0 | 33.439 | 68.053 | 50.746 |
| 724.47 | 34.159 | 68.625 | 51.392 |
| 724.95 | 34.778 | 69.318 | 52.048 |
| 725.54 | 35.355 | 70.227 | 52.791 |
| 726.01 | 35.62 | 70.974 | 53.297 |
| 726.48 | 35.714 | 71.661 | 53.688 |
| 726.95 | 35.569 | 72.273 | 53.921 |
| 727.53 | 35.171 | 72.866 | 54.018 |
| 728.0 | 34.616 | 73.155 | 53.886 |
| 728.46 | 33.876 | 73.203 | 53.54 |
| 729.03 | 32.653 | 73.046 | 52.849 |
| 729.49 | 31.493 | 72.65 | 52.072 |
| 730.06 | 29.962 | 71.853 | 50.907 |
| 730.51 | 28.672 | 71.054 | 49.863 |
| 730.96 | 27.34 | 70.021 | 48.68 |
| 731.52 | 25.76 | 68.565 | 47.162 |
| 731.97 | 24.566 | 67.294 | 45.93 |
| 732.52 | 23.247 | 65.597 | 44.422 |
| 732.97 | 22.388 | 64.257 | 43.323 |
| 733.52 | 21.486 | 62.553 | 42.02 |
| 733.96 | 20.995 | 61.234 | 41.115 |
| 734.5 | 20.636 | 59.746 | 40.191 |
| 735.04 | 20.572 | 58.512 | 39.542 |
| 735.47 | 20.702 | 57.654 | 39.178 |
| 736.01 | 21.13 | 56.823 | 38.977 |
| 736.55 | 21.86 | 56.261 | 39.06 |
| 736.97 | 22.581 | 56.011 | 39.296 |
| 737.5 | 23.773 | 55.975 | 39.874 |
| 738.03 | 25.173 | 56.264 | 40.718 |
| 738.55 | 26.733 | 56.773 | 41.753 |
| 738.97 | 28.093 | 57.337 | 42.715 |
| 739.49 | 29.858 | 58.269 | 44.063 |
| 740.01 | 31.626 | 59.409 | 45.517 |
| 740.52 | 33.326 | 60.643 | 46.985 |
| 741.03 | 34.922 | 62.026 | 48.474 |
| 741.54 | 36.359 | 63.508 | 49.934 |
| 742.05 | 37.599 | 64.963 | 51.281 |
| 742.46 | 38.333 | 66.08 | 52.206 |
| 742.96 | 39.055 | 67.364 | 53.21 |
| 743.47 | 39.515 | 68.583 | 54.049 |
| 743.97 | 39.701 | 69.605 | 54.653 |
| 744.47 | 39.595 | 70.503 | 55.049 |
| 744.96 | 39.287 | 71.12 | 55.203 |
| 745.46 | 38.743 | 71.556 | 55.149 |
| 745.96 | 38.079 | 71.807 | 54.943 |
| 746.55 | 37.187 | 71.827 | 54.507 |
| 747.04 | 36.452 | 71.69 | 54.071 |
| 747.53 | 35.794 | 71.496 | 53.645 |
| 748.02 | 35.314 | 71.188 | 53.251 |
| 748.51 | 35.038 | 70.798 | 52.918 |
| 749.0 | 34.946 | 70.505 | 52.725 |
| 749.49 | 35.187 | 70.224 | 52.706 |
| 749.98 | 35.649 | 70.09 | 52.87 |
| 750.47 | 36.339 | 70.031 | 53.185 |
| 751.05 | 37.416 | 70.226 | 53.821 |
| 751.54 | 38.504 | 70.532 | 54.518 |
| 752.03 | 39.652 | 71.016 | 55.334 |
| 752.51 | 40.803 | 71.655 | 56.229 |
| 753.0 | 41.951 | 72.451 | 57.201 |
| 753.49 | 43.053 | 73.364 | 58.209 |
| 753.98 | 43.918 | 74.307 | 59.112 |
| 754.47 | 44.736 | 75.261 | 59.998 |
| 754.96 | 45.26 | 76.233 | 60.746 |
| 755.55 | 45.703 | 77.315 | 61.509 |
| 756.04 | 45.736 | 78.171 | 61.954 |
| 756.53 | 45.605 | 78.837 | 62.221 |
| 757.03 | 45.277 | 79.375 | 62.326 |
| 757.52 | 44.725 | 79.717 | 62.221 |
| 758.02 | 44.009 | 79.885 | 61.947 |
| 758.52 | 43.241 | 79.867 | 61.554 |
| 759.02 | 42.341 | 79.643 | 60.992 |
| 759.52 | 41.613 | 79.245 | 60.429 |
| 760.02 | 40.998 | 78.709 | 59.853 |
| 760.53 | 40.438 | 78.094 | 59.266 |
| 761.04 | 40.031 | 77.445 | 58.738 |
| 761.55 | 39.865 | 76.815 | 58.34 |
| 761.95 | 39.876 | 76.334 | 58.105 |
| 762.47 | 40.03 | 75.752 | 57.891 |
| 762.98 | 40.299 | 75.297 | 57.798 |
| 763.5 | 40.738 | 74.946 | 57.842 |
| 764.02 | 41.166 | 74.774 | 57.97 |
| 764.55 | 41.598 | 74.744 | 58.171 |
| 764.97 | 41.9 | 74.84 | 58.37 |
| 765.49 | 42.211 | 75.038 | 58.625 |
| 766.02 | 42.373 | 75.344 | 58.858 |
| 766.45 | 42.342 | 75.669 | 59.006 |
| 766.98 | 42.206 | 75.993 | 59.1 |
| 767.52 | 41.817 | 76.423 | 59.12 |
| 767.95 | 41.434 | 76.667 | 59.051 |
| 768.5 | 40.745 | 76.964 | 58.854 |
| 769.04 | 39.878 | 77.072 | 58.475 |
| 769.48 | 39.09 | 77.043 | 58.067 |
| 770.03 | 38.022 | 76.842 | 57.432 |
| 770.48 | 37.112 | 76.536 | 56.824 |
| 771.03 | 36.009 | 76.022 | 56.015 |
| 771.48 | 35.192 | 75.419 | 55.305 |
| 772.04 | 34.288 | 74.525 | 54.406 |
| 772.49 | 33.717 | 73.696 | 53.706 |
| 772.95 | 33.373 | 72.796 | 53.084 |
| 773.52 | 33.192 | 71.574 | 52.383 |
| 773.97 | 33.282 | 70.67 | 51.976 |
| 774.55 | 33.723 | 69.525 | 51.624 |
| 775.01 | 34.344 | 68.693 | 51.519 |
| 775.47 | 35.131 | 68.006 | 51.568 |
| 776.05 | 36.299 | 67.311 | 51.805 |
| 776.52 | 37.378 | 66.97 | 52.174 |
| 776.99 | 38.411 | 66.866 | 52.638 |
| 777.46 | 39.401 | 66.927 | 53.164 |
| 778.05 | 40.573 | 67.332 | 53.952 |
| 778.53 | 41.275 | 67.88 | 54.578 |
| 779.01 | 41.782 | 68.591 | 55.186 |
| 779.49 | 42.063 | 69.471 | 55.767 |
| 779.97 | 42.084 | 70.492 | 56.288 |
| 780.45 | 41.935 | 71.658 | 56.796 |
| 781.05 | 41.335 | 73.115 | 57.225 |
| 781.54 | 40.539 | 74.219 | 57.379 |
| 782.02 | 39.482 | 75.272 | 57.377 |
| 782.51 | 38.203 | 76.243 | 57.223 |
| 783.0 | 36.765 | 76.959 | 56.862 |
| 783.49 | 35.13 | 77.479 | 56.305 |
| 783.99 | 33.41 | 77.74 | 55.575 |
| 784.48 | 31.68 | 77.672 | 54.676 |
| 784.97 | 30.02 | 77.401 | 53.71 |
| 785.47 | 28.54 | 76.864 | 52.702 |
| 785.97 | 27.241 | 75.943 | 51.592 |
| 786.47 | 26.219 | 74.858 | 50.538 |
| 786.97 | 25.476 | 73.45 | 49.463 |
| 787.47 | 25.003 | 71.952 | 48.478 |
| 787.97 | 25.001 | 70.289 | 47.645 |
| 788.47 | 25.256 | 68.58 | 46.918 |
| 788.97 | 25.913 | 66.857 | 46.385 |
| 789.48 | 26.851 | 65.211 | 46.031 |
| 789.98 | 28.186 | 63.701 | 45.944 |
| 790.49 | 29.805 | 62.374 | 46.089 |
| 791.0 | 31.577 | 61.275 | 46.426 |
| 791.5 | 33.379 | 60.462 | 46.92 |
| 792.01 | 35.129 | 59.944 | 47.536 |
| 792.52 | 36.689 | 59.724 | 48.207 |
| 793.03 | 38.063 | 59.811 | 48.937 |
| 793.53 | 39.095 | 60.258 | 49.677 |
| 794.04 | 39.769 | 61.002 | 50.385 |
| 794.55 | 40.201 | 62.008 | 51.104 |
| 795.06 | 40.287 | 63.366 | 51.826 |
| 795.44 | 40.205 | 64.486 | 52.345 |
| 795.95 | 39.705 | 66.124 | 52.915 |
| 796.46 | 38.846 | 67.873 | 53.36 |
| 796.97 | 37.53 | 69.668 | 53.599 |
| 797.48 | 35.95 | 71.356 | 53.653 |
| 797.99 | 33.921 | 72.83 | 53.376 |
| 798.5 | 31.539 | 74.168 | 52.853 |
| 799.01 | 28.91 | 75.112 | 52.011 |
| 799.52 | 26.35 | 75.771 | 51.061 |
| 800.03 | 23.757 | 76.023 | 49.89 |
| 800.54 | 21.401 | 75.793 | 48.597 |
| 801.04 | 19.309 | 75.169 | 47.239 |
| 801.55 | 17.573 | 74.1 | 45.836 |
| 802.05 | 16.179 | 72.572 | 44.375 |
| 802.56 | 15.083 | 70.717 | 42.9 |
| 803.06 | 14.33 | 68.566 | 41.448 |
| 803.44 | 13.905 | 66.796 | 40.351 |
| 803.95 | 13.563 | 64.232 | 38.898 |
| 804.45 | 13.439 | 61.592 | 37.515 |
| 804.95 | 13.51 | 59.049 | 36.279 |
| 805.45 | 13.791 | 56.524 | 35.158 |
| 805.95 | 14.288 | 54.142 | 34.215 |
| 806.45 | 14.986 | 52.018 | 33.502 |
| 806.94 | 15.864 | 50.178 | 33.021 |
| 807.56 | 17.216 | 48.236 | 32.726 |
| 808.06 | 18.447 | 47.094 | 32.77 |
| 808.55 | 19.78 | 46.265 | 33.022 |
| 809.04 | 21.117 | 45.76 | 33.438 |
| 809.53 | 22.455 | 45.576 | 34.016 |
| 810.02 | 23.716 | 45.612 | 34.664 |
| 810.51 | 24.866 | 45.995 | 35.431 |
| 811.0 | 25.847 | 46.584 | 36.216 |
| 811.48 | 26.674 | 47.415 | 37.044 |
| 811.96 | 27.308 | 48.506 | 37.907 |
| 812.56 | 27.871 | 50.043 | 38.957 |
| 813.04 | 28.109 | 51.424 | 39.766 |
| 813.52 | 28.074 | 52.899 | 40.486 |
| 814.0 | 27.857 | 54.448 | 41.152 |
| 814.47 | 27.437 | 55.945 | 41.691 |
| 815.06 | 26.681 | 57.744 | 42.212 |
| 815.53 | 25.864 | 59.052 | 42.458 |
| 816.0 | 24.944 | 60.243 | 42.593 |
| 816.46 | 23.902 | 61.224 | 42.563 |
| 817.05 | 22.594 | 62.207 | 42.401 |
| 817.51 | 21.553 | 62.789 | 42.171 |
| 817.97 | 20.598 | 63.118 | 41.858 |
| 818.54 | 19.545 | 63.219 | 41.382 |
| 819.0 | 18.847 | 63.023 | 40.935 |
| 819.45 | 18.272 | 62.686 | 40.479 |
| 820.02 | 17.7 | 62.014 | 39.857 |
| 820.47 | 17.366 | 61.264 | 39.315 |
| 821.03 | 17.14 | 60.185 | 38.662 |
| 821.47 | 17.007 | 59.222 | 38.114 |
| 822.03 | 16.936 | 58.004 | 37.47 |
| 822.47 | 16.96 | 56.953 | 36.957 |
| 823.02 | 17.026 | 55.686 | 36.356 |
| 823.45 | 17.096 | 54.752 | 35.924 |
| 824.0 | 17.242 | 53.64 | 35.441 |
| 824.54 | 17.358 | 52.7 | 35.029 |
| 824.97 | 17.419 | 52.044 | 34.732 |
| 825.5 | 17.523 | 51.326 | 34.425 |
| 826.03 | 17.585 | 50.766 | 34.176 |
| 826.46 | 17.616 | 50.412 | 34.014 |
| 826.99 | 17.627 | 50.096 | 33.861 |
| 827.51 | 17.56 | 49.878 | 33.719 |
| 828.03 | 17.463 | 49.752 | 33.607 |
| 828.55 | 17.338 | 49.697 | 33.518 |
| 828.97 | 17.232 | 49.689 | 33.461 |
| 829.48 | 17.007 | 49.718 | 33.362 |
| 830.0 | 16.815 | 49.752 | 33.283 |
| 830.51 | 16.577 | 49.747 | 33.162 |
| 831.01 | 16.355 | 49.768 | 33.061 |
| 831.52 | 16.138 | 49.729 | 32.934 |
| 832.02 | 15.939 | 49.669 | 32.804 |
| 832.53 | 15.774 | 49.522 | 32.648 |
| 833.03 | 15.658 | 49.322 | 32.49 |
| 833.52 | 15.537 | 49.078 | 32.308 |
| 834.02 | 15.517 | 48.753 | 32.135 |
| 834.52 | 15.487 | 48.402 | 31.945 |
| 835.01 | 15.521 | 47.993 | 31.757 |
| 835.5 | 15.59 | 47.535 | 31.562 |
| 835.99 | 15.649 | 47.048 | 31.349 |
| 836.48 | 15.721 | 46.599 | 31.16 |
| 836.97 | 15.827 | 46.134 | 30.981 |
| 837.46 | 15.938 | 45.743 | 30.84 |
| 838.04 | 16.028 | 45.298 | 30.663 |
| 838.53 | 16.032 | 44.991 | 30.511 |
| 839.01 | 16.085 | 44.798 | 30.441 |
| 839.5 | 16.045 | 44.679 | 30.362 |
| 839.98 | 15.98 | 44.615 | 30.297 |
| 840.46 | 15.888 | 44.647 | 30.268 |
| 841.04 | 15.696 | 44.826 | 30.261 |
| 841.53 | 15.484 | 45.098 | 30.291 |
| 842.01 | 15.242 | 45.409 | 30.326 |
| 842.49 | 14.941 | 45.816 | 30.379 |
| 842.98 | 14.639 | 46.277 | 30.458 |
| 843.46 | 14.295 | 46.768 | 30.531 |
| 844.04 | 13.838 | 47.357 | 30.597 |
| 844.53 | 13.518 | 47.858 | 30.688 |
| 845.02 | 13.195 | 48.287 | 30.741 |
| 845.5 | 12.894 | 48.68 | 30.787 |
| 845.99 | 12.681 | 48.984 | 30.833 |
| 846.48 | 12.547 | 49.196 | 30.872 |
| 846.97 | 12.502 | 49.253 | 30.877 |
| 847.46 | 12.579 | 49.226 | 30.903 |
| 847.96 | 12.763 | 49.071 | 30.917 |
| 848.55 | 13.22 | 48.654 | 30.937 |
| 849.05 | 13.824 | 48.196 | 31.01 |
| 849.55 | 14.621 | 47.603 | 31.112 |
| 850.05 | 15.594 | 46.85 | 31.222 |
| 850.55 | 16.758 | 46.079 | 31.418 |
| 850.96 | 17.752 | 45.41 | 31.581 |
| 851.46 | 19.068 | 44.49 | 31.779 |
| 851.97 | 20.383 | 43.581 | 31.982 |
| 852.48 | 21.623 | 42.716 | 32.169 |
| 852.99 | 22.708 | 41.921 | 32.315 |
| 853.51 | 23.66 | 41.161 | 32.41 |
| 854.03 | 24.47 | 40.555 | 32.513 |
| 854.55 | 25.09 | 40.109 | 32.599 |
| 854.97 | 25.462 | 39.881 | 32.672 |
| 855.49 | 25.761 | 39.762 | 32.762 |
| 856.02 | 25.862 | 39.866 | 32.864 |
| 856.55 | 25.786 | 40.209 | 32.998 |
| 856.98 | 25.566 | 40.696 | 33.131 |
| 857.51 | 25.056 | 41.494 | 33.275 |
| 858.05 | 24.331 | 42.591 | 33.461 |
| 858.48 | 23.575 | 43.639 | 33.607 |
| 859.03 | 22.402 | 45.258 | 33.83 |
| 859.46 | 21.335 | 46.685 | 34.01 |
| 860.01 | 19.825 | 48.704 | 34.265 |
| 860.45 | 18.627 | 50.449 | 34.538 |
| 861.01 | 17.208 | 52.712 | 34.96 |
| 861.45 | 16.148 | 54.541 | 35.344 |
| 862.01 | 15.076 | 56.772 | 35.924 |
| 862.46 | 14.543 | 58.491 | 36.517 |
| 863.02 | 14.199 | 60.408 | 37.304 |
| 863.48 | 14.301 | 61.653 | 37.977 |
| 864.05 | 15.027 | 62.95 | 38.988 |
| 864.51 | 16.148 | 63.639 | 39.893 |
| 864.97 | 17.72 | 63.993 | 40.857 |
| 865.54 | 20.234 | 63.993 | 42.113 |
| 866.01 | 22.728 | 63.596 | 43.162 |
| 866.47 | 25.214 | 62.884 | 44.049 |
| 867.06 | 27.767 | 61.552 | 44.66 |
| 867.53 | 29.636 | 60.184 | 44.91 |
| 868.0 | 30.957 | 58.525 | 44.741 |
| 868.47 | 32.118 | 56.691 | 44.404 |
| 868.95 | 33.017 | 54.693 | 43.855 |
| 869.54 | 33.77 | 52.074 | 42.922 |
| 870.02 | 34.25 | 50.046 | 42.148 |
| 870.5 | 34.529 | 48.062 | 41.295 |
| 870.98 | 34.726 | 46.227 | 40.477 |
| 871.47 | 34.535 | 44.605 | 39.57 |
| 871.95 | 34.131 | 43.242 | 38.686 |
| 872.56 | 33.202 | 41.931 | 37.567 |
| 873.05 | 32.219 | 41.276 | 36.748 |
| 873.54 | 30.821 | 40.926 | 35.873 |
| 874.03 | 28.866 | 40.976 | 34.921 |
| 874.52 | 26.441 | 41.396 | 33.919 |
| 875.01 | 23.598 | 42.208 | 32.903 |
| 875.5 | 20.463 | 43.422 | 31.942 |
| 876.0 | 17.728 | 44.992 | 31.36 |
| 876.5 | 15.465 | 47.072 | 31.269 |
| 876.99 | 14.057 | 49.507 | 31.782 |
| 877.49 | 13.609 | 52.241 | 32.925 |
| 877.99 | 14.081 | 55.215 | 34.648 |
| 878.49 | 15.248 | 58.375 | 36.812 |
| 878.99 | 16.535 | 61.525 | 39.03 |
| 879.49 | 17.623 | 64.468 | 41.045 |
| 880.0 | 18.375 | 67.118 | 42.747 |
| 880.5 | 18.785 | 69.411 | 44.098 |
| 881.0 | 19.092 | 71.253 | 45.172 |
| 881.51 | 19.216 | 72.483 | 45.849 |
| 882.01 | 19.323 | 73.193 | 46.258 |
| 882.52 | 19.38 | 73.295 | 46.338 |
| 883.02 | 19.446 | 72.857 | 46.151 |
| 883.53 | 19.383 | 71.784 | 45.583 |
| 884.03 | 19.255 | 70.15 | 44.703 |
| 884.54 | 18.996 | 67.893 | 43.445 |
| 885.04 | 18.575 | 65.053 | 41.814 |
| 885.55 | 18.094 | 61.624 | 39.859 |
| 886.06 | 17.406 | 57.839 | 37.622 |
| 886.56 | 16.482 | 53.793 | 35.138 |
| 886.94 | 15.665 | 50.761 | 33.213 |
| 887.45 | 13.879 | 46.646 | 30.262 |
| 887.95 | 11.551 | 42.863 | 27.207 |
| 888.46 | 8.757 | 39.422 | 24.09 |
| 888.97 | 6.117 | 36.428 | 21.272 |
| 889.47 | 4.146 | 33.888 | 19.017 |
| 889.97 | 2.859 | 31.939 | 17.399 |
| 890.48 | 2.13 | 30.528 | 16.329 |
| 890.98 | 1.7 | 29.579 | 15.639 |
| 891.48 | 1.466 | 29.162 | 15.314 |
| 891.99 | 1.48 | 29.186 | 15.333 |
| 892.49 | 1.847 | 29.796 | 15.821 |
| 892.99 | 2.585 | 30.913 | 16.749 |
| 893.49 | 3.291 | 32.651 | 17.971 |
| 893.99 | 3.755 | 34.984 | 19.37 |
| 894.48 | 4.005 | 37.865 | 20.935 |
| 894.98 | 4.152 | 41.151 | 22.651 |
| 895.48 | 4.186 | 44.756 | 24.471 |
| 895.97 | 4.261 | 48.252 | 26.257 |
| 896.46 | 4.301 | 51.328 | 27.815 |
| 896.96 | 4.341 | 53.866 | 29.103 |
| 897.45 | 4.436 | 55.757 | 30.096 |
| 898.06 | 4.565 | 57.175 | 30.87 |
| 898.55 | 4.573 | 57.528 | 31.051 |
| 899.03 | 4.561 | 57.509 | 31.035 |
| 899.52 | 4.48 | 56.745 | 30.612 |
| 900.0 | 4.45 | 55.659 | 30.054 |
| 900.48 | 4.44 | 53.878 | 29.159 |
| 900.96 | 4.318 | 51.453 | 27.886 |
| 901.56 | 4.141 | 47.656 | 25.898 |
| 902.04 | 3.724 | 43.983 | 23.854 |
| 902.51 | 2.889 | 39.565 | 21.227 |
| 902.99 | 1.849 | 34.823 | 18.336 |
| 903.46 | 0.889 | 30.178 | 15.534 |
| 904.05 | 0.352 | 24.663 | 12.507 |
| 904.51 | 0.218 | 20.881 | 10.549 |
| 904.98 | 0.166 | 17.74 | 8.953 |
| 905.45 | 0.135 | 15.251 | 7.693 |
| 906.02 | 0.124 | 12.835 | 6.48 |
| 906.48 | 0.114 | 11.482 | 5.798 |
| 907.06 | 0.083 | 10.178 | 5.13 |
| 907.51 | 0.083 | 9.489 | 4.786 |
| 907.97 | 0.093 | 9.001 | 4.547 |
| 908.53 | 0.073 | 8.665 | 4.369 |
| 908.98 | 0.093 | 8.622 | 4.358 |
| 909.54 | 0.083 | 8.837 | 4.46 |
| 909.99 | 0.062 | 9.339 | 4.701 |
| 910.54 | 0.073 | 10.452 | 5.262 |
| 910.98 | 0.073 | 11.924 | 5.998 |
| 911.53 | 0.073 | 14.612 | 7.343 |
| 911.97 | 0.083 | 17.336 | 8.71 |
| 912.51 | 0.073 | 20.66 | 10.366 |
| 913.05 | 0.062 | 23.387 | 11.725 |
| 913.48 | 0.073 | 24.754 | 12.413 |
| 914.02 | 0.062 | 25.818 | 12.94 |
| 914.55 | 0.062 | 26.318 | 13.19 |
| 914.97 | 0.083 | 26.53 | 13.307 |
| 915.5 | 0.052 | 26.503 | 13.277 |
| 916.02 | 0.083 | 26.371 | 13.227 |
| 916.54 | 0.062 | 26.042 | 13.052 |
| 916.96 | 0.052 | 25.52 | 12.786 |
| 917.48 | 0.062 | 24.647 | 12.355 |
| 917.99 | 0.042 | 23.716 | 11.879 |
| 918.5 | 0.073 | 22.335 | 11.204 |
| 919.01 | 0.073 | 20.498 | 10.286 |
| 919.52 | 0.073 | 17.929 | 9.001 |
| 920.02 | 0.062 | 14.524 | 7.293 |
| 920.53 | 0.073 | 10.685 | 5.379 |
| 921.03 | 0.083 | 7.097 | 3.59 |
| 921.53 | 0.062 | 4.528 | 2.295 |
| 922.02 | 0.041 | 3.008 | 1.525 |
| 922.52 | 0.062 | 2.093 | 1.078 |
| 923.01 | 0.072 | 1.507 | 0.79 |
| 923.5 | 0.073 | 1.126 | 0.599 |
| 923.99 | 0.073 | 0.893 | 0.483 |
| 924.48 | 0.052 | 0.717 | 0.384 |
| 924.96 | 0.062 | 0.593 | 0.328 |
| 925.55 | 0.073 | 0.485 | 0.279 |
| 926.03 | 0.052 | 0.428 | 0.24 |
| 926.51 | 0.062 | 0.372 | 0.217 |
| 927.0 | 0.083 | 0.332 | 0.207 |
| 927.48 | 0.062 | 0.292 | 0.177 |
| 927.96 | 0.062 | 0.27 | 0.166 |
| 928.53 | 0.083 | 0.241 | 0.162 |
| 929.01 | 0.072 | 0.23 | 0.151 |
| 929.49 | 0.072 | 0.196 | 0.134 |
| 929.97 | 0.041 | 0.185 | 0.113 |
| 930.55 | 0.052 | 0.185 | 0.118 |
| 931.03 | 0.052 | 0.185 | 0.118 |
| 931.5 | 0.082 | 0.151 | 0.117 |
| 931.98 | 0.062 | 0.151 | 0.106 |
| 932.46 | 0.082 | 0.145 | 0.114 |
| 933.04 | 0.051 | 0.139 | 0.095 |
| 933.52 | 0.041 | 0.134 | 0.087 |
| 934.0 | 0.062 | 0.122 | 0.092 |
| 934.49 | 0.031 | 0.128 | 0.079 |
| 934.97 | 0.041 | 0.128 | 0.084 |
| 935.55 | 0.061 | 0.116 | 0.089 |
| 936.04 | 0.072 | 0.127 | 0.099 |
| 936.53 | 0.061 | 0.111 | 0.086 |
| 937.01 | 0.061 | 0.11 | 0.086 |
| 937.51 | 0.082 | 0.121 | 0.101 |
| 938.0 | 0.061 | 0.11 | 0.086 |
| 938.49 | 0.071 | 0.104 | 0.088 |
| 938.99 | 0.061 | 0.099 | 0.08 |
| 939.48 | 0.061 | 0.098 | 0.08 |
| 939.98 | 0.071 | 0.104 | 0.087 |
| 940.49 | 0.051 | 0.109 | 0.08 |
| 940.99 | 0.041 | 0.093 | 0.067 |
| 941.5 | 0.051 | 0.098 | 0.074 |
| 942.01 | 0.071 | 0.092 | 0.082 |
| 942.52 | 0.061 | 0.098 | 0.079 |
| 943.03 | 0.071 | 0.098 | 0.084 |
| 943.55 | 0.071 | 0.092 | 0.081 |
| 943.96 | 0.06 | 0.103 | 0.082 |
| 944.48 | 0.05 | 0.108 | 0.079 |
| 945.0 | 0.05 | 0.097 | 0.074 |
| 945.53 | 0.05 | 0.097 | 0.073 |
| 945.95 | 0.04 | 0.086 | 0.063 |
| 946.48 | 0.06 | 0.102 | 0.081 |
| 947.02 | 0.07 | 0.102 | 0.086 |
| 947.55 | 0.06 | 0.107 | 0.084 |
| 947.98 | 0.06 | 0.091 | 0.075 |
| 948.53 | 0.06 | 0.091 | 0.075 |
| 948.96 | 0.07 | 0.101 | 0.086 |
| 949.51 | 0.05 | 0.09 | 0.07 |
| 949.95 | 0.05 | 0.09 | 0.07 |
| 950.5 | 0.06 | 0.095 | 0.077 |
| 950.95 | 0.089 | 0.09 | 0.09 |
| 951.5 | 0.069 | 0.105 | 0.087 |
| 951.95 | 0.04 | 0.09 | 0.065 |
| 952.51 | 0.059 | 0.1 | 0.08 |
| 952.97 | 0.069 | 0.094 | 0.082 |
| 953.53 | 0.069 | 0.089 | 0.079 |
| 953.99 | 0.069 | 0.094 | 0.081 |
| 954.45 | 0.069 | 0.084 | 0.076 |
| 955.03 | 0.049 | 0.089 | 0.069 |
| 955.49 | 0.069 | 0.104 | 0.086 |
| 955.95 | 0.068 | 0.093 | 0.081 |
| 956.53 | 0.049 | 0.098 | 0.074 |
| 957.0 | 0.058 | 0.093 | 0.076 |
| 957.47 | 0.088 | 0.108 | 0.098 |
| 958.06 | 0.058 | 0.093 | 0.075 |
| 958.54 | 0.049 | 0.108 | 0.078 |
| 959.01 | 0.068 | 0.103 | 0.085 |
| 959.49 | 0.087 | 0.107 | 0.097 |
| 959.97 | 0.068 | 0.102 | 0.085 |
| 960.45 | 0.096 | 0.092 | 0.094 |
| 961.05 | 0.067 | 0.107 | 0.087 |
| 961.53 | 0.058 | 0.111 | 0.085 |
| 962.02 | 0.077 | 0.106 | 0.092 |
| 962.5 | 0.086 | 0.111 | 0.099 |
| 962.99 | 0.048 | 0.096 | 0.072 |
| 963.48 | 0.057 | 0.121 | 0.089 |
| 963.97 | 0.057 | 0.116 | 0.087 |
| 964.46 | 0.067 | 0.115 | 0.091 |
| 964.95 | 0.105 | 0.115 | 0.11 |
| 965.56 | 0.067 | 0.135 | 0.101 |
| 966.06 | 0.047 | 0.13 | 0.089 |
| 966.55 | 0.076 | 0.13 | 0.103 |
| 967.05 | 0.095 | 0.129 | 0.112 |
| 967.55 | 0.057 | 0.134 | 0.095 |
| 968.04 | 0.066 | 0.119 | 0.092 |
| 968.54 | 0.066 | 0.134 | 0.1 |
| 969.04 | 0.066 | 0.148 | 0.107 |
| 969.54 | 0.084 | 0.153 | 0.119 |
| 970.04 | 0.047 | 0.147 | 0.097 |
| 970.54 | 0.103 | 0.162 | 0.132 |
| 971.04 | 0.056 | 0.176 | 0.116 |
| 971.54 | 0.103 | 0.176 | 0.139 |
| 972.05 | 0.074 | 0.185 | 0.13 |
| 972.55 | 0.084 | 0.2 | 0.142 |
| 973.05 | 0.074 | 0.214 | 0.144 |
| 973.55 | 0.065 | 0.199 | 0.132 |
| 974.05 | 0.074 | 0.209 | 0.141 |
| 974.56 | 0.055 | 0.242 | 0.149 |
| 975.06 | 0.065 | 0.251 | 0.158 |
| 975.56 | 0.064 | 0.256 | 0.16 |
| 976.06 | 0.064 | 0.289 | 0.176 |
| 976.44 | 0.073 | 0.298 | 0.186 |
| 976.94 | 0.073 | 0.322 | 0.197 |
| 977.44 | 0.073 | 0.364 | 0.219 |
| 977.95 | 0.055 | 0.388 | 0.221 |
| 978.45 | 0.064 | 0.425 | 0.244 |
| 978.95 | 0.064 | 0.472 | 0.268 |
| 979.45 | 0.091 | 0.495 | 0.293 |
| 979.95 | 0.055 | 0.547 | 0.301 |
| 980.44 | 0.082 | 0.622 | 0.352 |
| 980.94 | 0.081 | 0.688 | 0.385 |
| 981.56 | 0.081 | 0.802 | 0.441 |
| 982.06 | 0.063 | 0.891 | 0.477 |
| 982.55 | 0.108 | 1.009 | 0.558 |
| 983.05 | 0.099 | 1.158 | 0.629 |
| 983.54 | 0.081 | 1.314 | 0.697 |
| 984.03 | 0.117 | 1.503 | 0.81 |
| 984.52 | 0.081 | 1.747 | 0.914 |
| 985.01 | 0.116 | 2.019 | 1.067 |
| 985.5 | 0.098 | 2.352 | 1.225 |
| 985.99 | 0.098 | 2.758 | 1.428 |
| 986.48 | 0.098 | 3.24 | 1.669 |
| 986.96 | 0.107 | 3.818 | 1.962 |
| 987.56 | 0.115 | 4.758 | 2.436 |
| 988.05 | 0.124 | 5.64 | 2.882 |
| 988.53 | 0.124 | 6.742 | 3.433 |
| 989.0 | 0.133 | 8.038 | 4.085 |
| 989.48 | 0.168 | 9.589 | 4.879 |
| 990.01 | 0.293 | 19.998 | 10.146 |
| 990.51 | 0.325 | 22.959 | 11.642 |
| 991.02 | 0.364 | 26.606 | 13.485 |
| 991.52 | 0.411 | 30.194 | 15.302 |
| 992.03 | 0.474 | 34.255 | 17.364 |
| 992.53 | 0.568 | 38.067 | 19.318 |
| 993.03 | 0.671 | 42.472 | 21.571 |
| 993.53 | 0.819 | 46.304 | 23.562 |
| 994.04 | 1.022 | 50.63 | 25.826 |
| 994.54 | 1.272 | 54.603 | 27.937 |
| 995.04 | 1.636 | 58.767 | 30.201 |
| 995.54 | 2.094 | 62.606 | 32.35 |
| 996.04 | 2.707 | 66.721 | 34.714 |
| 996.53 | 3.555 | 70.247 | 36.901 |
| 997.03 | 4.627 | 74.099 | 39.363 |
| 997.53 | 6.055 | 77.469 | 41.762 |
| 998.02 | 7.878 | 80.669 | 44.274 |
| 998.52 | 10.163 | 83.586 | 46.875 |
| 999.01 | 12.928 | 86.39 | 49.659 |
| 999.51 | 16.017 | 88.767 | 52.392 |
| 1000.0 | 19.602 | 90.894 | 55.248 |
| 1000.49 | 23.678 | 92.572 | 58.125 |
| 1000.98 | 27.639 | 94.083 | 60.861 |
| 1001.47 | 32.195 | 95.191 | 63.693 |
| 1001.96 | 36.66 | 96.107 | 66.384 |
| 1002.45 | 41.203 | 96.73 | 68.966 |
| 1002.94 | 45.628 | 97.248 | 71.438 |
| 1003.43 | 50.266 | 97.565 | 73.916 |
| 1003.92 | 54.737 | 97.75 | 76.243 |
| 1004.4 | 59.209 | 97.945 | 78.577 |
| 1004.89 | 63.525 | 98.069 | 80.797 |
| 1005.61 | 69.708 | 98.169 | 83.939 |
| 1006.09 | 73.928 | 98.289 | 86.109 |
| 1006.58 | 77.736 | 98.326 | 88.031 |
| 1007.06 | 81.458 | 98.437 | 89.948 |
| 1007.54 | 84.61 | 98.527 | 91.569 |
| 1008.02 | 87.454 | 98.633 | 93.043 |
| 1008.5 | 89.868 | 98.722 | 94.295 |
| 1008.97 | 91.772 | 98.787 | 95.28 |
| 1009.45 | 93.214 | 98.862 | 96.038 |
| 1009.92 | 94.402 | 98.948 | 96.675 |
| 1010.4 | 95.132 | 99.013 | 97.072 |
| 1011.11 | 95.848 | 99.124 | 97.486 |
| 1011.58 | 96.103 | 99.182 | 97.643 |
| 1012.05 | 96.298 | 99.195 | 97.747 |
| 1012.52 | 96.402 | 99.236 | 97.819 |
| 1012.99 | 96.539 | 99.273 | 97.906 |
| 1013.46 | 96.638 | 99.302 | 97.97 |
| 1013.93 | 96.714 | 99.302 | 98.008 |
| 1014.4 | 96.84 | 99.313 | 98.076 |
| 1015.09 | 97.062 | 99.32 | 98.191 |
| 1015.56 | 97.226 | 99.319 | 98.273 |
| 1016.02 | 97.38 | 99.315 | 98.348 |
| 1016.48 | 97.536 | 99.324 | 98.43 |
| 1016.95 | 97.683 | 99.311 | 98.497 |
| 1017.41 | 97.808 | 99.312 | 98.56 |
| 1018.1 | 97.994 | 99.323 | 98.658 |
| 1018.55 | 98.136 | 99.311 | 98.723 |
| 1019.01 | 98.239 | 99.327 | 98.783 |
| 1019.47 | 98.367 | 99.347 | 98.857 |
| 1019.92 | 98.411 | 99.324 | 98.868 |
| 1020.6 | 98.55 | 99.343 | 98.947 |
| 1021.06 | 98.619 | 99.366 | 98.992 |
| 1021.51 | 98.679 | 99.369 | 99.024 |
| 1021.96 | 98.754 | 99.395 | 99.074 |
| 1022.41 | 98.765 | 99.356 | 99.06 |
| 1023.08 | 98.845 | 99.353 | 99.099 |
| 1023.53 | 98.891 | 99.383 | 99.137 |
| 1023.98 | 98.888 | 99.377 | 99.133 |
| 1024.42 | 98.914 | 99.385 | 99.15 |
| 1025.09 | 98.922 | 99.385 | 99.153 |
| 1025.53 | 98.92 | 99.389 | 99.155 |
| 1025.97 | 98.939 | 99.406 | 99.172 |
| 1026.42 | 98.947 | 99.412 | 99.179 |
| 1027.08 | 98.923 | 99.399 | 99.161 |
| 1027.52 | 98.952 | 99.387 | 99.17 |
| 1027.95 | 98.93 | 99.364 | 99.147 |
| 1028.61 | 98.946 | 99.362 | 99.154 |
| 1029.04 | 98.914 | 99.366 | 99.14 |
| 1029.48 | 98.914 | 99.37 | 99.142 |
| 1029.91 | 98.928 | 99.327 | 99.128 |
| 1030.56 | 98.917 | 99.348 | 99.133 |
| 1031.0 | 98.942 | 99.325 | 99.134 |
| 1031.43 | 98.962 | 99.332 | 99.147 |
| 1032.07 | 98.987 | 99.344 | 99.166 |
| 1032.5 | 98.964 | 99.348 | 99.156 |
| 1032.93 | 98.974 | 99.347 | 99.161 |
| 1033.57 | 99.002 | 99.33 | 99.166 |
| 1033.99 | 98.973 | 99.363 | 99.168 |
| 1034.42 | 98.969 | 99.363 | 99.166 |
| 1035.06 | 98.976 | 99.351 | 99.164 |
| 1035.48 | 98.948 | 99.395 | 99.171 |
| 1035.9 | 98.942 | 99.368 | 99.155 |
| 1036.53 | 98.945 | 99.384 | 99.164 |
| 1036.95 | 98.878 | 99.369 | 99.124 |
| 1037.58 | 98.844 | 99.421 | 99.132 |
| 1038.0 | 98.829 | 99.428 | 99.128 |
| 1038.42 | 98.766 | 99.418 | 99.092 |
| 1039.04 | 98.702 | 99.419 | 99.061 |
| 1039.46 | 98.693 | 99.455 | 99.074 |
| 1040.08 | 98.657 | 99.439 | 99.048 |
| 1040.49 | 98.531 | 99.442 | 98.986 |
| 1040.91 | 98.498 | 99.44 | 98.969 |
| 1041.53 | 98.44 | 99.451 | 98.946 |
| 1041.94 | 98.382 | 99.406 | 98.894 |
| 1042.55 | 98.325 | 99.417 | 98.871 |
| 1042.96 | 98.323 | 99.425 | 98.874 |
| 1043.58 | 98.25 | 99.393 | 98.822 |
| 1043.99 | 98.215 | 99.353 | 98.784 |
| 1044.6 | 98.172 | 99.353 | 98.763 |
| 1045.01 | 98.161 | 99.332 | 98.746 |
| 1045.41 | 98.158 | 99.293 | 98.725 |
| 1046.02 | 98.187 | 99.257 | 98.722 |
| 1046.43 | 98.173 | 99.241 | 98.707 |
| 1047.03 | 98.186 | 99.222 | 98.704 |
| 1047.44 | 98.209 | 99.187 | 98.698 |
| 1048.04 | 98.27 | 99.161 | 98.716 |
| 1048.44 | 98.265 | 99.122 | 98.694 |
| 1049.05 | 98.337 | 99.088 | 98.713 |
| 1049.45 | 98.372 | 99.093 | 98.732 |
| 1050.05 | 98.439 | 99.032 | 98.736 |
| 1050.45 | 98.488 | 99.043 | 98.766 |
| 1051.05 | 98.52 | 99.01 | 98.765 |
| 1051.45 | 98.583 | 98.998 | 98.79 |
| 1052.05 | 98.659 | 98.993 | 98.826 |
| 1052.45 | 98.665 | 98.968 | 98.816 |
| 1053.04 | 98.685 | 98.952 | 98.818 |
| 1053.44 | 98.705 | 98.966 | 98.835 |
| 1054.04 | 98.711 | 98.955 | 98.833 |
| 1054.44 | 98.721 | 98.968 | 98.844 |
| 1055.03 | 98.671 | 98.978 | 98.825 |
| 1055.43 | 98.667 | 98.994 | 98.83 |
| 1056.02 | 98.592 | 98.999 | 98.795 |
| 1056.42 | 98.605 | 99.015 | 98.81 |
| 1057.01 | 98.539 | 99.058 | 98.798 |
| 1057.41 | 98.507 | 99.034 | 98.771 |
| 1058.0 | 98.449 | 99.074 | 98.761 |
| 1058.6 | 98.322 | 99.08 | 98.701 |
| 1058.99 | 98.296 | 99.129 | 98.712 |
| 1059.58 | 98.199 | 99.158 | 98.678 |
| 1059.98 | 98.137 | 99.168 | 98.652 |
| 1060.57 | 98.029 | 99.192 | 98.611 |
| 1060.97 | 97.972 | 99.235 | 98.603 |
| 1061.56 | 97.888 | 99.238 | 98.563 |
| 1061.95 | 97.844 | 99.252 | 98.548 |
| 1062.55 | 97.756 | 99.266 | 98.511 |
| 1062.94 | 97.704 | 99.288 | 98.496 |
| 1063.54 | 97.662 | 99.306 | 98.484 |
| 1063.93 | 97.655 | 99.3 | 98.478 |
| 1064.52 | 97.578 | 99.345 | 98.461 |
| 1064.92 | 97.6 | 99.345 | 98.472 |
| 1065.51 | 97.59 | 99.361 | 98.476 |
| 1065.91 | 97.546 | 99.37 | 98.458 |
| 1066.5 | 97.584 | 99.385 | 98.485 |
| 1067.1 | 97.59 | 99.363 | 98.476 |
| 1067.5 | 97.635 | 99.369 | 98.502 |
| 1068.09 | 97.647 | 99.387 | 98.517 |
| 1068.49 | 97.679 | 99.375 | 98.527 |
| 1069.09 | 97.772 | 99.374 | 98.573 |
| 1069.49 | 97.799 | 99.362 | 98.581 |
| 1070.08 | 97.839 | 99.393 | 98.616 |
| 1070.48 | 97.914 | 99.375 | 98.645 |
| 1071.08 | 97.94 | 99.382 | 98.661 |
| 1071.48 | 97.983 | 99.352 | 98.668 |
| 1072.08 | 98.071 | 99.344 | 98.708 |
| 1072.49 | 98.127 | 99.353 | 98.74 |
| 1073.09 | 98.179 | 99.339 | 98.759 |
| 1073.49 | 98.247 | 99.317 | 98.782 |
| 1074.09 | 98.284 | 99.336 | 98.81 |
| 1074.5 | 98.358 | 99.318 | 98.838 |
| 1075.1 | 98.396 | 99.327 | 98.862 |
| 1075.51 | 98.414 | 99.324 | 98.869 |
| 1075.91 | 98.473 | 99.29 | 98.881 |
| 1076.52 | 98.497 | 99.332 | 98.914 |
| 1076.93 | 98.555 | 99.303 | 98.929 |
| 1077.54 | 98.61 | 99.297 | 98.954 |
| 1077.95 | 98.604 | 99.285 | 98.945 |
| 1078.56 | 98.68 | 99.3 | 98.99 |
| 1078.97 | 98.663 | 99.308 | 98.985 |
| 1079.59 | 98.715 | 99.298 | 99.007 |
| 1080.0 | 98.752 | 99.332 | 99.042 |
| 1080.41 | 98.754 | 99.304 | 99.029 |
| 1081.03 | 98.809 | 99.263 | 99.036 |
| 1081.44 | 98.831 | 99.259 | 99.045 |
| 1082.06 | 98.837 | 99.259 | 99.048 |
| 1082.48 | 98.916 | 99.238 | 99.077 |
| 1083.1 | 98.894 | 99.256 | 99.075 |
| 1083.52 | 98.898 | 99.252 | 99.075 |
| 1083.94 | 98.921 | 99.261 | 99.091 |
| 1084.56 | 98.924 | 99.241 | 99.082 |
| 1084.98 | 98.957 | 99.217 | 99.087 |
| 1085.4 | 98.948 | 99.234 | 99.091 |
| 1086.03 | 98.963 | 99.21 | 99.086 |
| 1086.46 | 98.967 | 99.201 | 99.084 |
| 1087.09 | 98.997 | 99.201 | 99.099 |
| 1087.52 | 98.978 | 99.198 | 99.088 |
| 1087.94 | 98.971 | 99.203 | 99.087 |
| 1088.58 | 98.944 | 99.199 | 99.071 |
| 1089.01 | 98.925 | 99.187 | 99.056 |
| 1089.44 | 98.953 | 99.176 | 99.065 |
| 1090.08 | 98.903 | 99.22 | 99.062 |
| 1090.51 | 98.901 | 99.174 | 99.038 |
| 1090.94 | 98.889 | 99.201 | 99.045 |
| 1091.59 | 98.855 | 99.222 | 99.038 |
| 1092.02 | 98.829 | 99.207 | 99.018 |
| 1092.46 | 98.825 | 99.204 | 99.015 |
| 1093.11 | 98.754 | 99.205 | 98.98 |
| 1093.54 | 98.711 | 99.211 | 98.961 |
| 1093.98 | 98.649 | 99.207 | 98.928 |
| 1094.42 | 98.605 | 99.217 | 98.911 |
| 1095.08 | 98.517 | 99.225 | 98.871 |
| 1095.52 | 98.337 | 99.244 | 98.79 |
| 1095.96 | 98.214 | 99.248 | 98.731 |
| 1096.4 | 97.95 | 99.263 | 98.607 |
| 1097.07 | 97.561 | 99.267 | 98.414 |
| 1097.51 | 97.167 | 99.277 | 98.222 |
| 1097.96 | 96.698 | 99.276 | 97.987 |
| 1098.41 | 96.092 | 99.274 | 97.683 |
| 1099.08 | 95.025 | 99.285 | 97.155 |
| 1099.53 | 94.165 | 99.302 | 96.733 |
| 1099.98 | 93.119 | 99.287 | 96.203 |
| 1100.43 | 92.067 | 99.31 | 95.688 |
| 1101.1 | 89.881 | 99.291 | 94.586 |
| 1101.56 | 88.247 | 99.316 | 93.781 |
| 1102.01 | 86.488 | 99.303 | 92.895 |
| 1102.47 | 84.497 | 99.267 | 91.882 |
| 1102.92 | 82.437 | 99.269 | 90.853 |
| 1103.61 | 78.991 | 99.273 | 89.132 |
| 1104.07 | 76.707 | 99.247 | 87.977 |
| 1104.53 | 74.05 | 99.208 | 86.629 |
| 1104.99 | 71.416 | 99.177 | 85.297 |
| 1105.45 | 68.726 | 99.159 | 83.942 |
| 1105.91 | 65.977 | 99.124 | 82.551 |
| 1106.61 | 61.359 | 99.051 | 80.205 |
| 1107.07 | 58.508 | 99.02 | 78.764 |
| 1107.54 | 55.36 | 98.93 | 77.145 |
| 1108.0 | 52.275 | 98.877 | 75.576 |
| 1108.47 | 49.107 | 98.819 | 73.963 |
| 1108.94 | 45.98 | 98.749 | 72.364 |
| 1109.41 | 42.917 | 98.696 | 70.806 |
| 1110.11 | 38.266 | 98.585 | 68.425 |
| 1110.58 | 35.414 | 98.493 | 66.954 |
| 1111.06 | 32.401 | 98.418 | 65.409 |
| 1111.53 | 29.683 | 98.302 | 63.993 |
| 1112.0 | 26.777 | 98.234 | 62.505 |
| 1112.48 | 24.248 | 98.142 | 61.195 |
| 1112.96 | 21.742 | 98.056 | 59.899 |
| 1113.43 | 19.532 | 97.963 | 58.747 |
| 1113.91 | 17.249 | 97.841 | 57.545 |
| 1114.39 | 15.373 | 97.759 | 56.566 |
| 1115.11 | 12.684 | 97.573 | 55.128 |
| 1115.59 | 11.103 | 97.494 | 54.299 |
| 1116.07 | 9.768 | 97.374 | 53.571 |
| 1116.56 | 8.573 | 97.297 | 52.935 |
| 1117.04 | 7.503 | 97.212 | 52.357 |
| 1117.52 | 6.55 | 97.08 | 51.815 |
| 1118.01 | 5.785 | 96.969 | 51.377 |
| 1118.49 | 5.121 | 96.848 | 50.985 |
| 1118.98 | 4.488 | 96.723 | 50.606 |
| 1119.47 | 3.987 | 96.572 | 50.28 |
| 1119.96 | 3.528 | 96.443 | 49.985 |
| 1120.45 | 3.139 | 96.26 | 49.7 |
| 1120.94 | 2.796 | 96.046 | 49.421 |
| 1121.43 | 2.508 | 95.818 | 49.163 |
| 1121.92 | 2.251 | 95.542 | 48.896 |
| 1122.41 | 2.029 | 95.212 | 48.62 |
| 1122.91 | 1.838 | 94.85 | 48.344 |
| 1123.4 | 1.673 | 94.334 | 48.004 |
| 1123.89 | 1.527 | 93.821 | 47.674 |
| 1124.39 | 1.407 | 93.208 | 47.307 |
| 1124.89 | 1.305 | 92.526 | 46.916 |
| 1125.38 | 1.21 | 91.648 | 46.429 |
| 1125.88 | 1.135 | 90.685 | 45.91 |
| 1126.38 | 1.06 | 89.593 | 45.326 |
| 1126.88 | 0.996 | 88.489 | 44.743 |
| 1127.38 | 0.949 | 87.062 | 44.006 |
| 1127.88 | 0.91 | 85.65 | 43.28 |
| 1128.38 | 0.872 | 83.916 | 42.394 |
| 1128.88 | 0.858 | 82.241 | 41.549 |
| 1129.38 | 0.843 | 80.187 | 40.515 |
| 1129.88 | 0.838 | 78.222 | 39.53 |
| 1130.39 | 0.849 | 75.925 | 38.387 |
| 1130.89 | 0.87 | 73.667 | 37.268 |
| 1131.4 | 0.909 | 71.105 | 36.007 |
| 1131.9 | 0.958 | 68.652 | 34.805 |
| 1132.41 | 1.017 | 65.889 | 33.453 |
| 1132.91 | 1.076 | 63.323 | 32.199 |
| 1133.42 | 1.125 | 60.403 | 30.764 |
| 1133.93 | 1.173 | 57.647 | 29.41 |
| 1134.43 | 1.196 | 54.747 | 27.971 |
| 1134.94 | 1.221 | 51.979 | 26.6 |
| 1135.45 | 1.224 | 48.966 | 25.095 |
| 1135.96 | 1.224 | 46.292 | 23.758 |
| 1136.47 | 1.238 | 43.495 | 22.367 |
| 1136.98 | 1.225 | 40.898 | 21.062 |
| 1137.49 | 1.218 | 38.168 | 19.693 |
| 1138.0 | 1.207 | 35.737 | 18.472 |
| 1138.51 | 1.202 | 33.224 | 17.213 |
| 1139.02 | 1.189 | 30.995 | 16.092 |
| 1139.53 | 1.18 | 28.75 | 14.965 |
| 1140.05 | 1.169 | 26.791 | 13.98 |
| 1140.56 | 1.147 | 24.81 | 12.978 |
| 1141.07 | 1.134 | 23.096 | 12.115 |
| 1141.58 | 1.109 | 21.342 | 11.226 |
| 1142.1 | 1.095 | 19.868 | 10.481 |
| 1142.61 | 1.066 | 18.37 | 9.718 |
| 1143.13 | 1.039 | 17.148 | 9.094 |
| 1143.38 | 1.015 | 16.477 | 8.746 |
| 1143.9 | 0.971 | 15.312 | 8.141 |
| 1144.41 | 0.919 | 14.232 | 7.575 |
| 1144.93 | 0.831 | 13.24 | 7.036 |
| 1145.44 | 0.739 | 12.358 | 6.548 |
| 1145.96 | 0.638 | 11.525 | 6.081 |
| 1146.47 | 0.53 | 10.804 | 5.667 |
| 1146.99 | 0.419 | 10.128 | 5.273 |
| 1147.5 | 0.341 | 9.531 | 4.936 |
| 1148.02 | 0.263 | 8.974 | 4.618 |
| 1148.54 | 0.2 | 8.476 | 4.338 |
| 1149.05 | 0.161 | 8.03 | 4.096 |
| 1149.57 | 0.132 | 7.622 | 3.877 |
| 1150.08 | 0.113 | 7.248 | 3.68 |
| 1150.6 | 0.098 | 6.923 | 3.511 |
| 1151.12 | 0.083 | 6.632 | 3.357 |
| 1151.63 | 0.078 | 6.377 | 3.228 |
| 1151.89 | 0.078 | 6.256 | 3.167 |
| 1152.41 | 0.074 | 6.047 | 3.06 |
| 1152.92 | 0.064 | 5.845 | 2.954 |
| 1153.44 | 0.069 | 5.702 | 2.885 |
| 1153.96 | 0.059 | 5.549 | 2.804 |
| 1154.47 | 0.059 | 5.447 | 2.753 |
| 1154.99 | 0.054 | 5.357 | 2.705 |
| 1155.5 | 0.054 | 5.297 | 2.676 |
| 1156.02 | 0.054 | 5.262 | 2.658 |
| 1156.54 | 0.049 | 5.255 | 2.652 |
| 1157.05 | 0.054 | 5.267 | 2.661 |
| 1157.57 | 0.054 | 5.3 | 2.677 |
| 1158.08 | 0.049 | 5.38 | 2.715 |
| 1158.6 | 0.044 | 5.484 | 2.764 |
| 1159.11 | 0.049 | 5.621 | 2.835 |
| 1159.63 | 0.039 | 5.783 | 2.911 |
| 1159.88 | 0.044 | 5.873 | 2.959 |
| 1160.4 | 0.049 | 6.085 | 3.067 |
| 1160.91 | 0.039 | 6.311 | 3.175 |
| 1161.43 | 0.044 | 6.561 | 3.303 |
| 1161.94 | 0.044 | 6.803 | 3.424 |
| 1162.45 | 0.039 | 7.047 | 3.543 |
| 1162.97 | 0.044 | 7.273 | 3.659 |
| 1163.48 | 0.04 | 7.462 | 3.751 |
| 1163.99 | 0.04 | 7.608 | 3.824 |
| 1164.5 | 0.045 | 7.72 | 3.883 |
| 1165.01 | 0.04 | 7.749 | 3.894 |
| 1165.53 | 0.04 | 7.762 | 3.901 |
| 1166.04 | 0.045 | 7.721 | 3.883 |
| 1166.55 | 0.04 | 7.642 | 3.841 |
| 1167.06 | 0.035 | 7.525 | 3.78 |
| 1167.57 | 0.035 | 7.35 | 3.692 |
| 1168.08 | 0.04 | 7.152 | 3.596 |
| 1168.58 | 0.04 | 6.917 | 3.479 |
| 1169.09 | 0.04 | 6.639 | 3.34 |
| 1169.6 | 0.035 | 6.316 | 3.175 |
| 1170.11 | 0.035 | 5.962 | 2.998 |
| 1170.61 | 0.035 | 5.572 | 2.803 |
| 1171.12 | 0.04 | 5.151 | 2.595 |
| 1171.63 | 0.03 | 4.697 | 2.363 |
| 1171.88 | 0.035 | 4.486 | 2.26 |
| 1172.38 | 0.035 | 3.983 | 2.009 |
| 1172.89 | 0.03 | 3.522 | 1.776 |
| 1173.39 | 0.04 | 3.049 | 1.545 |
| 1173.89 | 0.035 | 2.632 | 1.333 |
| 1174.4 | 0.035 | 2.238 | 1.136 |
| 1174.9 | 0.035 | 1.89 | 0.963 |
| 1175.4 | 0.035 | 1.578 | 0.806 |
| 1175.9 | 0.035 | 1.345 | 0.69 |
| 1176.4 | 0.035 | 1.122 | 0.579 |
| 1176.9 | 0.035 | 0.956 | 0.496 |
| 1177.4 | 0.035 | 0.81 | 0.422 |
| 1177.9 | 0.035 | 0.702 | 0.369 |
| 1178.39 | 0.03 | 0.599 | 0.315 |
| 1178.89 | 0.035 | 0.527 | 0.281 |
| 1179.39 | 0.035 | 0.454 | 0.244 |
| 1179.88 | 0.03 | 0.398 | 0.214 |
| 1180.62 | 0.014 | 0.328 | 0.171 |
| 1181.12 | 0.009 | 0.288 | 0.148 |
| 1181.61 | 0.009 | 0.25 | 0.129 |
| 1182.1 | 0.009 | 0.225 | 0.117 |
| 1182.59 | 0.009 | 0.206 | 0.107 |
| 1183.08 | 0.009 | 0.186 | 0.098 |
| 1183.57 | 0.009 | 0.17 | 0.09 |
| 1184.06 | 0.009 | 0.155 | 0.082 |
| 1184.55 | 0.013 | 0.139 | 0.076 |
| 1185.03 | 0.013 | 0.131 | 0.072 |
| 1185.52 | 0.009 | 0.12 | 0.064 |
| 1186.01 | 0.009 | 0.112 | 0.06 |
| 1186.49 | 0.009 | 0.1 | 0.055 |
| 1186.97 | 0.009 | 0.092 | 0.051 |
| 1187.46 | 0.009 | 0.092 | 0.051 |
| 1187.94 | 0.009 | 0.084 | 0.047 |
| 1188.42 | 0.009 | 0.08 | 0.045 |
| 1188.9 | 0.009 | 0.073 | 0.041 |
| 1189.62 | 0.013 | 0.069 | 0.041 |
| 1190.1 | 0.009 | 0.065 | 0.037 |
| 1190.57 | 0.009 | 0.061 | 0.035 |
| 1191.05 | 0.009 | 0.057 | 0.033 |
| 1191.53 | 0.009 | 0.057 | 0.033 |
| 1192.0 | 0.009 | 0.057 | 0.033 |
| 1192.47 | 0.009 | 0.049 | 0.029 |
| 1192.95 | 0.013 | 0.049 | 0.031 |
| 1193.42 | 0.009 | 0.049 | 0.029 |
| 1193.89 | 0.009 | 0.049 | 0.029 |
| 1194.59 | 0.004 | 0.045 | 0.025 |
| 1195.06 | 0.009 | 0.041 | 0.025 |
| 1195.53 | 0.013 | 0.037 | 0.025 |
| 1195.99 | 0.009 | 0.045 | 0.027 |
| 1196.46 | 0.009 | 0.041 | 0.025 |
| 1196.92 | 0.009 | 0.037 | 0.023 |
| 1197.39 | 0.009 | 0.037 | 0.023 |
| 1198.08 | 0.004 | 0.037 | 0.021 |
| 1198.54 | 0.009 | 0.037 | 0.023 |
| 1199.0 | 0.009 | 0.033 | 0.021 |
| 1199.46 | 0.013 | 0.03 | 0.021 |
| 1199.92 | 0.013 | 0.03 | 0.021 |
| 1200.61 | 0.013 | 0.03 | 0.021 |
| 1201.06 | 0.004 | 0.03 | 0.017 |
| 1201.52 | 0.013 | 0.029 | 0.021 |
| 1201.97 | 0.009 | 0.029 | 0.019 |
| 1202.42 | 0.009 | 0.029 | 0.019 |
| 1203.1 | 0.009 | 0.026 | 0.017 |
| 1203.55 | 0.004 | 0.029 | 0.017 |
| 1204.0 | 0.009 | 0.029 | 0.019 |
| 1204.45 | 0.009 | 0.029 | 0.019 |
| 1204.9 | 0.009 | 0.029 | 0.019 |
| 1205.57 | 0.009 | 0.025 | 0.017 |
| 1206.01 | 0.004 | 0.025 | 0.015 |
| 1206.46 | 0.009 | 0.025 | 0.017 |
| 1206.9 | 0.009 | 0.025 | 0.017 |
| 1207.57 | 0.009 | 0.022 | 0.015 |
| 1208.01 | 0.004 | 0.022 | 0.013 |
| 1208.45 | 0.009 | 0.022 | 0.015 |
| 1209.11 | 0.009 | 0.025 | 0.017 |
| 1209.54 | 0.009 | 0.025 | 0.017 |
| 1209.98 | 0.009 | 0.025 | 0.017 |
| 1210.42 | 0.004 | 0.022 | 0.013 |
| 1211.07 | 0.013 | 0.021 | 0.017 |
| 1211.5 | 0.009 | 0.025 | 0.017 |
| 1211.94 | 0.004 | 0.025 | 0.015 |
| 1212.58 | 0.004 | 0.025 | 0.015 |
| 1213.01 | 0.009 | 0.021 | 0.015 |
| 1213.44 | 0.013 | 0.021 | 0.017 |
| 1214.09 | 0.009 | 0.025 | 0.017 |
| 1214.51 | 0.004 | 0.021 | 0.013 |
| 1214.94 | 0.009 | 0.021 | 0.015 |
| 1215.58 | 0.009 | 0.021 | 0.015 |
| 1216.0 | 0.004 | 0.021 | 0.013 |
| 1216.43 | 0.009 | 0.018 | 0.013 |
| 1217.06 | 0.009 | 0.018 | 0.013 |
| 1217.48 | 0.004 | 0.018 | 0.011 |
| 1217.9 | 0.009 | 0.021 | 0.015 |
| 1218.53 | 0.009 | 0.021 | 0.015 |
| 1218.95 | 0.009 | 0.021 | 0.015 |
| 1219.58 | 0.013 | 0.018 | 0.015 |
| 1220.0 | 0.009 | 0.014 | 0.011 |
| 1220.41 | 0.009 | 0.021 | 0.015 |
| 1221.04 | 0.004 | 0.021 | 0.013 |
| 1221.45 | 0.009 | 0.017 | 0.013 |
| 1222.07 | 0.009 | 0.017 | 0.013 |
| 1222.48 | 0.004 | 0.021 | 0.013 |
| 1223.1 | 0.009 | 0.017 | 0.013 |
| 1223.51 | 0.009 | 0.017 | 0.013 |
| 1223.92 | 0.009 | 0.021 | 0.015 |
| 1224.53 | 0.009 | 0.017 | 0.013 |
| 1224.94 | 0.004 | 0.017 | 0.011 |
| 1225.55 | 0.004 | 0.017 | 0.011 |
| 1225.96 | 0.013 | 0.017 | 0.015 |
| 1226.57 | 0.009 | 0.017 | 0.013 |
| 1226.98 | 0.004 | 0.017 | 0.011 |
| 1227.58 | 0.009 | 0.021 | 0.015 |
| 1227.99 | 0.004 | 0.017 | 0.011 |
| 1228.59 | 0.009 | 0.017 | 0.013 |
| 1229.0 | 0.004 | 0.017 | 0.011 |
| 1229.6 | 0.009 | 0.017 | 0.013 |
| 1230.0 | 0.009 | 0.021 | 0.015 |
| 1230.6 | 0.009 | 0.017 | 0.013 |
| 1231.0 | 0.004 | 0.017 | 0.011 |
| 1231.6 | 0.009 | 0.021 | 0.015 |
| 1232.0 | 0.004 | 0.017 | 0.011 |
| 1232.6 | 0.009 | 0.021 | 0.015 |
| 1233.0 | 0.004 | 0.017 | 0.011 |
| 1233.6 | 0.009 | 0.017 | 0.013 |
| 1233.99 | 0.009 | 0.014 | 0.011 |
| 1234.59 | 0.009 | 0.017 | 0.013 |
| 1234.98 | 0.009 | 0.017 | 0.013 |
| 1235.58 | 0.009 | 0.017 | 0.013 |
| 1235.97 | 0.009 | 0.017 | 0.013 |
| 1236.57 | 0.009 | 0.014 | 0.011 |
| 1236.96 | 0.004 | 0.017 | 0.011 |
| 1237.56 | 0.009 | 0.014 | 0.011 |
| 1237.95 | 0.009 | 0.017 | 0.013 |
| 1238.54 | 0.009 | 0.014 | 0.011 |
| 1238.94 | 0.004 | 0.017 | 0.011 |
| 1239.53 | 0.009 | 0.02 | 0.014 |
| 1239.92 | 0.004 | 0.02 | 0.012 |
| 1240.51 | 0.004 | 0.017 | 0.011 |
| 1241.1 | 0.009 | 0.02 | 0.014 |
| 1241.5 | 0.009 | 0.017 | 0.013 |
| 1242.09 | 0.009 | 0.02 | 0.014 |
| 1242.48 | 0.009 | 0.017 | 0.013 |
| 1243.07 | 0.009 | 0.017 | 0.013 |
| 1243.46 | 0.004 | 0.017 | 0.011 |
| 1244.05 | 0.004 | 0.02 | 0.012 |
| 1244.44 | 0.009 | 0.017 | 0.013 |
| 1245.04 | 0.004 | 0.02 | 0.012 |
| 1245.43 | 0.004 | 0.017 | 0.011 |
| 1246.02 | 0.009 | 0.017 | 0.013 |
| 1246.41 | 0.004 | 0.02 | 0.012 |
| 1247.0 | 0.004 | 0.017 | 0.011 |
| 1247.59 | 0.004 | 0.017 | 0.011 |
| 1247.99 | 0.004 | 0.014 | 0.009 |
| 1248.58 | 0.004 | 0.017 | 0.011 |
| 1248.98 | 0.009 | 0.024 | 0.016 |
| 1249.57 | 0.009 | 0.02 | 0.014 |
| 1249.96 | 0.009 | 0.014 | 0.011 |
| 1250.56 | 0.009 | 0.02 | 0.014 |
| 1250.95 | 0.009 | 0.017 | 0.013 |
| 1251.55 | 0.004 | 0.02 | 0.012 |
| 1251.95 | 0.009 | 0.02 | 0.014 |
| 1252.54 | 0.009 | 0.02 | 0.014 |
| 1252.94 | 0.009 | 0.013 | 0.011 |
| 1253.54 | 0.004 | 0.017 | 0.011 |
| 1253.94 | 0.004 | 0.017 | 0.011 |
| 1254.53 | 0.004 | 0.02 | 0.012 |
| 1254.93 | 0.009 | 0.017 | 0.013 |
| 1255.53 | 0.004 | 0.017 | 0.011 |
| 1255.93 | 0.004 | 0.02 | 0.012 |
| 1256.54 | 0.004 | 0.017 | 0.011 |
| 1256.94 | 0.004 | 0.017 | 0.011 |
| 1257.54 | 0.009 | 0.02 | 0.014 |
| 1257.95 | 0.009 | 0.017 | 0.013 |
| 1258.55 | 0.009 | 0.017 | 0.013 |
| 1258.96 | 0.013 | 0.017 | 0.015 |
| 1259.56 | 0.009 | 0.017 | 0.013 |
| 1259.97 | 0.004 | 0.02 | 0.012 |
| 1260.58 | 0.009 | 0.02 | 0.014 |
| 1260.99 | 0.004 | 0.02 | 0.012 |
| 1261.6 | 0.009 | 0.02 | 0.014 |
| 1262.01 | 0.004 | 0.02 | 0.012 |
| 1262.42 | 0.009 | 0.017 | 0.013 |
| 1263.04 | 0.004 | 0.017 | 0.011 |
| 1263.45 | 0.009 | 0.02 | 0.014 |
| 1264.07 | 0.009 | 0.02 | 0.014 |
| 1264.48 | 0.009 | 0.017 | 0.013 |
| 1265.1 | 0.009 | 0.017 | 0.013 |
| 1265.51 | 0.004 | 0.017 | 0.01 |
| 1265.93 | 0.009 | 0.02 | 0.014 |
| 1266.56 | 0.009 | 0.017 | 0.013 |
| 1266.97 | 0.008 | 0.02 | 0.014 |
| 1267.6 | 0.009 | 0.017 | 0.013 |
| 1268.02 | 0.004 | 0.017 | 0.01 |
| 1268.44 | 0.013 | 0.017 | 0.015 |
| 1269.07 | 0.004 | 0.02 | 0.012 |
| 1269.49 | 0.009 | 0.02 | 0.014 |
| 1269.92 | 0.004 | 0.02 | 0.012 |
| 1270.55 | 0.009 | 0.02 | 0.014 |
| 1270.98 | 0.009 | 0.017 | 0.013 |
| 1271.41 | 0.004 | 0.02 | 0.012 |
| 1272.05 | 0.009 | 0.02 | 0.014 |
| 1272.47 | 0.009 | 0.02 | 0.014 |
| 1272.9 | 0.009 | 0.02 | 0.014 |
| 1273.55 | 0.004 | 0.017 | 0.01 |
| 1273.98 | 0.009 | 0.02 | 0.014 |
| 1274.41 | 0.009 | 0.017 | 0.013 |
| 1275.06 | 0.009 | 0.02 | 0.014 |
| 1275.5 | 0.009 | 0.02 | 0.014 |
| 1275.93 | 0.013 | 0.02 | 0.016 |
| 1276.59 | 0.009 | 0.02 | 0.014 |
| 1277.02 | 0.009 | 0.02 | 0.014 |
| 1277.46 | 0.009 | 0.02 | 0.014 |
| 1277.9 | 0.009 | 0.02 | 0.014 |
| 1278.56 | 0.009 | 0.02 | 0.014 |
| 1279.0 | 0.009 | 0.023 | 0.016 |
| 1279.45 | 0 | 0.02 | 0.01 |
| 1280.11 | 0.004 | 0.023 | 0.014 |
| 1280.56 | 0.004 | 0.02 | 0.012 |
| 1281.0 | 0.004 | 0.02 | 0.012 |
| 1281.45 | 0.009 | 0.023 | 0.016 |
| 1281.9 | 0.009 | 0.02 | 0.014 |
| 1282.57 | 0.009 | 0.023 | 0.016 |
| 1283.02 | 0.004 | 0.02 | 0.012 |
| 1283.47 | 0.009 | 0.02 | 0.014 |
| 1283.93 | 0.009 | 0.02 | 0.014 |
| 1284.61 | 0.009 | 0.023 | 0.016 |
| 1285.06 | 0.004 | 0.02 | 0.012 |
| 1285.52 | 0.009 | 0.023 | 0.016 |
| 1285.97 | 0.009 | 0.02 | 0.014 |
| 1286.43 | 0.004 | 0.023 | 0.014 |
| 1286.89 | 0.009 | 0.024 | 0.016 |
| 1287.58 | 0.004 | 0.023 | 0.014 |
| 1288.04 | 0.013 | 0.023 | 0.018 |
| 1288.5 | 0.004 | 0.023 | 0.014 |
| 1288.96 | 0.004 | 0.024 | 0.014 |
| 1289.43 | 0.009 | 0.027 | 0.018 |
| 1289.89 | 0.004 | 0.024 | 0.014 |
| 1290.59 | 0.009 | 0.027 | 0.018 |
| 1291.06 | 0.009 | 0.027 | 0.018 |
| 1291.52 | 0.004 | 0.024 | 0.014 |
| 1291.99 | 0.013 | 0.03 | 0.022 |
| 1292.46 | 0.009 | 0.027 | 0.018 |
| 1292.93 | 0.004 | 0.027 | 0.016 |
| 1293.4 | 0.009 | 0.027 | 0.018 |
| 1294.11 | 0.004 | 0.027 | 0.016 |
| 1294.59 | 0.004 | 0.027 | 0.016 |
| 1295.06 | 0.013 | 0.027 | 0.02 |
| 1295.54 | 0.004 | 0.027 | 0.016 |
| 1296.01 | 0.004 | 0.034 | 0.019 |
| 1296.49 | 0.009 | 0.03 | 0.02 |
| 1296.97 | 0.009 | 0.03 | 0.02 |
| 1297.45 | 0.009 | 0.03 | 0.02 |
| 1297.93 | 0.009 | 0.03 | 0.019 |
| 1298.41 | 0.009 | 0.034 | 0.021 |
| 1298.89 | 0.009 | 0.03 | 0.02 |
| 1299.61 | 0.009 | 0.037 | 0.023 |
| 1300.1 | 0.004 | 0.034 | 0.019 |
| 1300.58 | 0.009 | 0.034 | 0.021 |
| 1301.07 | 0.009 | 0.034 | 0.021 |
| 1301.55 | 0.009 | 0.034 | 0.021 |
| 1302.04 | 0.009 | 0.041 | 0.025 |
| 1302.53 | 0.009 | 0.041 | 0.025 |
| 1303.02 | 0.009 | 0.037 | 0.023 |
| 1303.51 | 0.009 | 0.041 | 0.025 |
| 1304.0 | 0.013 | 0.041 | 0.027 |
| 1304.49 | 0.009 | 0.044 | 0.026 |
| 1304.98 | 0.009 | 0.044 | 0.026 |
| 1305.47 | 0.009 | 0.044 | 0.026 |
| 1305.96 | 0.009 | 0.051 | 0.03 |
| 1306.46 | 0.004 | 0.048 | 0.026 |
| 1306.95 | 0.004 | 0.051 | 0.028 |
| 1307.45 | 0.004 | 0.054 | 0.029 |
| 1307.94 | 0.009 | 0.061 | 0.035 |
| 1308.44 | 0.009 | 0.058 | 0.033 |
| 1308.94 | 0.009 | 0.065 | 0.037 |
| 1309.43 | 0.009 | 0.065 | 0.037 |
| 1309.93 | 0.009 | 0.068 | 0.038 |
| 1310.43 | 0.009 | 0.068 | 0.038 |
| 1310.93 | 0.009 | 0.072 | 0.04 |
| 1311.43 | 0.004 | 0.082 | 0.043 |
| 1311.93 | 0.009 | 0.085 | 0.047 |
| 1312.43 | 0.009 | 0.089 | 0.049 |
| 1312.94 | 0.004 | 0.096 | 0.05 |
| 1313.44 | 0.009 | 0.103 | 0.056 |
| 1313.94 | 0.009 | 0.106 | 0.057 |
| 1314.44 | 0.004 | 0.113 | 0.059 |
| 1314.95 | 0.009 | 0.123 | 0.066 |
| 1315.45 | 0.009 | 0.133 | 0.071 |
| 1315.96 | 0.009 | 0.143 | 0.076 |
| 1316.47 | 0.009 | 0.154 | 0.081 |
| 1316.97 | 0.009 | 0.164 | 0.087 |
| 1317.48 | 0.009 | 0.185 | 0.097 |
| 1317.99 | 0.009 | 0.199 | 0.104 |
| 1318.49 | 0.009 | 0.216 | 0.112 |
| 1319.0 | 0.009 | 0.233 | 0.121 |
| 1319.51 | 0.009 | 0.257 | 0.133 |
| 1320.02 | 0.004 | 0.284 | 0.144 |
| 1320.53 | 0.009 | 0.308 | 0.159 |
| 1321.04 | 0.013 | 0.343 | 0.178 |
| 1321.55 | 0.009 | 0.384 | 0.196 |
| 1322.06 | 0.009 | 0.432 | 0.221 |
| 1322.57 | 0.013 | 0.48 | 0.247 |
| 1323.08 | 0.013 | 0.539 | 0.276 |
| 1323.59 | 0.009 | 0.608 | 0.308 |
| 1324.1 | 0.013 | 0.681 | 0.347 |
| 1324.61 | 0.009 | 0.77 | 0.39 |
| 1325.13 | 0.013 | 0.873 | 0.443 |
| 1325.38 | 0.009 | 0.932 | 0.471 |
| 1325.89 | 0.009 | 1.049 | 0.529 |
| 1326.41 | 0.009 | 1.187 | 0.598 |
| 1326.92 | 0.009 | 1.337 | 0.673 |
| 1327.43 | 0.009 | 1.518 | 0.763 |
| 1327.95 | 0.009 | 1.678 | 0.844 |
| 1328.46 | 0.009 | 1.881 | 0.945 |
| 1328.97 | 0.009 | 2.074 | 1.041 |
| 1329.49 | 0.009 | 2.303 | 1.156 |
| 1330.0 | 0.009 | 2.507 | 1.258 |
| 1330.51 | 0.009 | 2.733 | 1.371 |
| 1331.03 | 0.009 | 2.936 | 1.472 |
| 1331.54 | 0.009 | 3.162 | 1.586 |
| 1332.06 | 0.009 | 3.375 | 1.692 |
| 1332.57 | 0.009 | 3.597 | 1.803 |
| 1333.08 | 0.009 | 3.777 | 1.893 |
| 1333.6 | 0.013 | 3.994 | 2.003 |
| 1334.11 | 0.013 | 4.171 | 2.092 |
| 1334.63 | 0.009 | 4.353 | 2.181 |
| 1334.88 | 0.009 | 4.436 | 2.222 |
| 1335.4 | 0.009 | 4.593 | 2.301 |
| 1335.91 | 0.009 | 4.759 | 2.384 |
| 1336.43 | 0.013 | 4.9 | 2.457 |
| 1336.94 | 0.014 | 5.042 | 2.528 |
| 1337.45 | 0.009 | 5.168 | 2.589 |
| 1337.97 | 0.009 | 5.286 | 2.648 |
| 1338.48 | 0.009 | 5.39 | 2.699 |
| 1338.99 | 0.014 | 5.496 | 2.755 |
| 1339.51 | 0.014 | 5.578 | 2.796 |
| 1340.02 | 0.014 | 5.647 | 2.83 |
| 1340.53 | 0.014 | 5.726 | 2.87 |
| 1341.05 | 0.014 | 5.777 | 2.895 |
| 1341.56 | 0.014 | 5.815 | 2.914 |
| 1342.07 | 0.009 | 5.849 | 2.929 |
| 1342.58 | 0.009 | 5.858 | 2.933 |
| 1343.09 | 0.009 | 5.859 | 2.934 |
| 1343.61 | 0.014 | 5.844 | 2.929 |
| 1344.12 | 0.014 | 5.813 | 2.913 |
| 1344.63 | 0.014 | 5.767 | 2.89 |
| 1344.88 | 0.009 | 5.735 | 2.872 |
| 1345.39 | 0.009 | 5.666 | 2.838 |
| 1345.9 | 0.014 | 5.587 | 2.8 |
| 1346.41 | 0.014 | 5.498 | 2.756 |
| 1346.92 | 0.014 | 5.398 | 2.706 |
| 1347.43 | 0.014 | 5.302 | 2.658 |
| 1347.94 | 0.009 | 5.194 | 2.602 |
| 1348.45 | 0.009 | 5.101 | 2.555 |
| 1348.96 | 0.014 | 5.011 | 2.512 |
| 1349.46 | 0.014 | 4.937 | 2.475 |
| 1349.97 | 0.014 | 4.865 | 2.439 |
| 1350.48 | 0.009 | 4.809 | 2.409 |
| 1350.98 | 0.009 | 4.76 | 2.385 |
| 1351.49 | 0.009 | 4.73 | 2.37 |
| 1351.99 | 0.014 | 4.715 | 2.365 |
| 1352.5 | 0.009 | 4.705 | 2.357 |
| 1353.0 | 0.014 | 4.715 | 2.365 |
| 1353.5 | 0.014 | 4.736 | 2.375 |
| 1354.01 | 0.014 | 4.767 | 2.39 |
| 1354.51 | 0.014 | 4.81 | 2.412 |
| 1355.01 | 0.014 | 4.871 | 2.443 |
| 1355.51 | 0.014 | 4.937 | 2.476 |
| 1356.01 | 0.01 | 5.023 | 2.516 |
| 1356.51 | 0.014 | 5.101 | 2.558 |
| 1357.01 | 0.014 | 5.209 | 2.612 |
| 1357.51 | 0.014 | 5.317 | 2.666 |
| 1358.01 | 0.014 | 5.45 | 2.732 |
| 1358.5 | 0.015 | 5.596 | 2.805 |
| 1359.0 | 0.015 | 5.757 | 2.886 |
| 1359.5 | 0.015 | 5.924 | 2.969 |
| 1359.99 | 0.015 | 6.129 | 3.072 |
| 1360.48 | 0.015 | 6.326 | 3.171 |
| 1360.98 | 0.02 | 6.548 | 3.284 |
| 1361.47 | 0.02 | 6.772 | 3.396 |
| 1361.96 | 0.015 | 7.032 | 3.523 |
| 1362.45 | 0.015 | 7.286 | 3.65 |
| 1362.95 | 0.015 | 7.602 | 3.808 |
| 1363.44 | 0.019 | 7.897 | 3.958 |
| 1363.92 | 0.019 | 8.232 | 4.126 |
| 1364.41 | 0.015 | 8.565 | 4.29 |
| 1364.9 | 0.019 | 8.959 | 4.489 |
| 1365.39 | 0.024 | 9.323 | 4.674 |
| 1366.12 | 0.02 | 9.994 | 5.007 |
| 1366.6 | 0.02 | 10.459 | 5.239 |
| 1367.09 | 0.02 | 10.954 | 5.487 |
| 1367.57 | 0.02 | 11.472 | 5.746 |
| 1368.05 | 0.029 | 12.032 | 6.031 |
| 1368.53 | 0.024 | 12.59 | 6.307 |
| 1369.01 | 0.019 | 13.192 | 6.606 |
| 1369.49 | 0.024 | 13.849 | 6.937 |
| 1369.97 | 0.024 | 14.511 | 7.268 |
| 1370.45 | 0.024 | 15.163 | 7.594 |
| 1370.93 | 0.024 | 15.899 | 7.962 |
| 1371.4 | 0.034 | 16.685 | 8.359 |
| 1372.11 | 0.033 | 17.79 | 8.912 |
| 1372.59 | 0.029 | 18.65 | 9.339 |
| 1373.06 | 0.033 | 19.417 | 9.725 |
| 1373.53 | 0.033 | 20.334 | 10.184 |
| 1374.01 | 0.038 | 21.233 | 10.636 |
| 1374.48 | 0.043 | 22.229 | 11.136 |
| 1374.95 | 0.043 | 23.112 | 11.577 |
| 1375.41 | 0.048 | 24.153 | 12.101 |
| 1376.11 | 0.053 | 25.692 | 12.873 |
| 1376.58 | 0.053 | 26.773 | 13.413 |
| 1377.05 | 0.064 | 27.806 | 13.935 |
| 1377.51 | 0.069 | 28.903 | 14.486 |
| 1377.97 | 0.069 | 30.077 | 15.073 |
| 1378.44 | 0.085 | 31.231 | 15.658 |
| 1378.9 | 0.086 | 32.383 | 16.234 |
| 1379.59 | 0.101 | 34.167 | 17.134 |
| 1380.05 | 0.111 | 35.408 | 17.76 |
| 1380.5 | 0.127 | 36.579 | 18.353 |
| 1380.96 | 0.147 | 37.853 | 19 |
| 1381.42 | 0.161 | 39.02 | 19.59 |
| 1382.1 | 0.19 | 41.062 | 20.626 |
| 1382.55 | 0.21 | 42.278 | 21.244 |
| 1383.01 | 0.238 | 43.599 | 21.918 |
| 1383.46 | 0.262 | 44.811 | 22.536 |
| 1383.91 | 0.295 | 46.065 | 23.18 |
| 1384.58 | 0.34 | 47.948 | 24.144 |
| 1385.03 | 0.374 | 49.133 | 24.754 |
| 1385.48 | 0.413 | 50.413 | 25.413 |
| 1385.93 | 0.452 | 51.622 | 26.037 |
| 1386.59 | 0.515 | 53.6 | 27.058 |
| 1387.04 | 0.552 | 54.738 | 27.645 |
| 1387.48 | 0.591 | 55.932 | 28.261 |
| 1387.92 | 0.634 | 57.112 | 28.873 |
| 1388.58 | 0.693 | 58.748 | 29.721 |
| 1389.02 | 0.732 | 59.883 | 30.307 |
| 1389.46 | 0.769 | 60.923 | 30.846 |
| 1389.9 | 0.807 | 62.051 | 31.429 |
| 1390.56 | 0.857 | 63.727 | 32.292 |
| 1390.99 | 0.89 | 64.768 | 32.829 |
| 1391.43 | 0.913 | 65.726 | 33.319 |
| 1392.08 | 0.96 | 67.207 | 34.084 |
| 1392.51 | 0.988 | 68.133 | 34.56 |
| 1392.94 | 1.012 | 69.026 | 35.019 |
| 1393.59 | 1.036 | 70.409 | 35.722 |
| 1394.01 | 1.046 | 71.276 | 36.161 |
| 1394.44 | 1.058 | 72.137 | 36.598 |
| 1395.08 | 1.073 | 73.332 | 37.203 |
| 1395.51 | 1.078 | 74.096 | 37.587 |
| 1395.93 | 1.076 | 74.853 | 37.964 |
| 1396.57 | 1.067 | 75.883 | 38.475 |
| 1396.99 | 1.062 | 76.533 | 38.797 |
| 1397.42 | 1.055 | 77.122 | 39.089 |
| 1398.05 | 1.034 | 78.058 | 39.546 |
| 1398.47 | 1.02 | 78.667 | 39.844 |
| 1399.1 | 0.999 | 79.573 | 40.286 |
| 1399.52 | 0.987 | 80.126 | 40.557 |
| 1399.93 | 0.975 | 80.608 | 40.792 |
| 1400.56 | 0.953 | 81.342 | 41.148 |
| 1400.97 | 0.947 | 81.832 | 41.39 |
| 1401.59 | 0.936 | 82.536 | 41.736 |
| 1402.01 | 0.926 | 82.925 | 41.925 |
| 1402.42 | 0.921 | 83.288 | 42.105 |
| 1403.04 | 0.912 | 83.913 | 42.413 |
| 1403.45 | 0.904 | 84.318 | 42.611 |
| 1404.06 | 0.905 | 84.888 | 42.897 |
| 1404.47 | 0.905 | 85.212 | 43.059 |
| 1405.09 | 0.915 | 85.715 | 43.315 |
| 1405.49 | 0.914 | 86.021 | 43.468 |
| 1406.1 | 0.917 | 86.437 | 43.677 |
| 1406.51 | 0.93 | 86.706 | 43.818 |
| 1406.91 | 0.932 | 87.008 | 43.97 |
| 1407.52 | 0.949 | 87.357 | 44.153 |
| 1407.93 | 0.963 | 87.62 | 44.291 |
| 1408.53 | 0.982 | 87.979 | 44.48 |
| 1408.93 | 0.995 | 88.194 | 44.595 |
| 1409.53 | 1.021 | 88.453 | 44.737 |
| 1409.94 | 1.039 | 88.663 | 44.851 |
| 1410.54 | 1.065 | 88.952 | 45.009 |
| 1410.94 | 1.084 | 89.083 | 45.084 |
| 1411.53 | 1.12 | 89.285 | 45.202 |
| 1411.93 | 1.142 | 89.434 | 45.288 |
| 1412.53 | 1.182 | 89.65 | 45.416 |
| 1412.93 | 1.201 | 89.756 | 45.478 |
| 1413.52 | 1.249 | 89.88 | 45.564 |
| 1413.92 | 1.284 | 90.022 | 45.653 |
| 1414.51 | 1.324 | 90.172 | 45.748 |
| 1414.91 | 1.368 | 90.236 | 45.802 |
| 1415.5 | 1.417 | 90.303 | 45.86 |
| 1416.09 | 1.474 | 90.375 | 45.924 |
| 1416.49 | 1.519 | 90.423 | 45.971 |
| 1417.08 | 1.585 | 90.458 | 46.021 |
| 1417.47 | 1.64 | 90.457 | 46.049 |
| 1418.06 | 1.723 | 90.49 | 46.106 |
| 1418.45 | 1.77 | 90.473 | 46.121 |
| 1419.04 | 1.866 | 90.487 | 46.177 |
| 1419.43 | 1.929 | 90.447 | 46.188 |
| 1420.02 | 2.018 | 90.414 | 46.216 |
| 1420.41 | 2.099 | 90.328 | 46.214 |
| 1421.0 | 2.203 | 90.236 | 46.219 |
| 1421.59 | 2.336 | 90.145 | 46.241 |
| 1421.98 | 2.423 | 90.079 | 46.251 |
| 1422.56 | 2.564 | 89.959 | 46.262 |
| 1422.96 | 2.669 | 89.83 | 46.249 |
| 1423.54 | 2.829 | 89.677 | 46.253 |
| 1423.93 | 2.943 | 89.525 | 46.234 |
| 1424.52 | 3.132 | 89.326 | 46.229 |
| 1424.91 | 3.274 | 89.162 | 46.218 |
| 1425.5 | 3.478 | 88.946 | 46.212 |
| 1426.08 | 3.72 | 88.706 | 46.213 |
| 1426.47 | 3.885 | 88.472 | 46.179 |
| 1427.06 | 4.148 | 88.22 | 46.184 |
| 1427.45 | 4.36 | 87.975 | 46.167 |
| 1428.04 | 4.676 | 87.636 | 46.156 |
| 1428.43 | 4.896 | 87.415 | 46.156 |
| 1429.02 | 5.272 | 87.045 | 46.159 |
| 1429.41 | 5.53 | 86.799 | 46.164 |
| 1430.0 | 5.98 | 86.405 | 46.192 |
| 1430.59 | 6.442 | 85.962 | 46.202 |
| 1430.98 | 6.77 | 85.662 | 46.216 |
| 1431.57 | 7.322 | 85.238 | 46.28 |
| 1431.96 | 7.72 | 84.916 | 46.318 |
| 1432.56 | 8.373 | 84.422 | 46.398 |
| 1432.95 | 8.869 | 84.115 | 46.492 |
| 1433.54 | 9.637 | 83.581 | 46.609 |
| 1433.94 | 10.178 | 83.239 | 46.709 |
| 1434.53 | 11.082 | 82.694 | 46.888 |
| 1434.93 | 11.713 | 82.32 | 47.017 |
| 1435.52 | 12.818 | 81.763 | 47.291 |
| 1435.92 | 13.577 | 81.333 | 47.455 |
| 1436.51 | 14.743 | 80.761 | 47.752 |
| 1436.91 | 15.671 | 80.355 | 48.013 |
| 1437.51 | 17.114 | 79.746 | 48.43 |
| 1437.91 | 18.139 | 79.362 | 48.75 |
| 1438.51 | 19.695 | 78.672 | 49.184 |
| 1438.91 | 20.85 | 78.228 | 49.539 |
| 1439.51 | 22.668 | 77.607 | 50.138 |
| 1439.91 | 23.909 | 77.169 | 50.539 |
| 1440.52 | 25.858 | 76.539 | 51.199 |
| 1440.92 | 27.26 | 76.094 | 51.677 |
| 1441.53 | 29.402 | 75.416 | 52.409 |
| 1441.93 | 30.769 | 74.979 | 52.874 |
| 1442.54 | 33.044 | 74.354 | 53.699 |
| 1442.95 | 34.451 | 73.874 | 54.163 |
| 1443.56 | 36.836 | 73.239 | 55.038 |
| 1443.97 | 38.312 | 72.809 | 55.56 |
| 1444.58 | 40.44 | 72.174 | 56.307 |
| 1444.99 | 42.05 | 71.754 | 56.902 |
| 1445.6 | 44.272 | 71.143 | 57.708 |
| 1446.02 | 45.657 | 70.771 | 58.214 |
| 1446.43 | 47.017 | 70.351 | 58.684 |
| 1447.05 | 48.989 | 69.769 | 59.379 |
| 1447.46 | 50.254 | 69.387 | 59.82 |
| 1448.08 | 52.042 | 68.808 | 60.425 |
| 1448.5 | 53.162 | 68.481 | 60.821 |
| 1448.92 | 54.281 | 68.098 | 61.189 |
| 1449.54 | 55.713 | 67.587 | 61.65 |
| 1449.96 | 56.679 | 67.276 | 61.978 |
| 1450.59 | 57.914 | 66.779 | 62.346 |
| 1451.01 | 58.688 | 66.514 | 62.601 |
| 1451.43 | 59.327 | 66.22 | 62.774 |
| 1452.07 | 60.202 | 65.819 | 63.01 |
| 1452.49 | 60.744 | 65.561 | 63.153 |
| 1452.91 | 61.245 | 65.313 | 63.279 |
| 1453.55 | 61.881 | 64.97 | 63.426 |
| 1453.98 | 62.254 | 64.748 | 63.501 |
| 1454.41 | 62.585 | 64.577 | 63.581 |
| 1455.05 | 63.016 | 64.287 | 63.651 |
| 1455.48 | 63.313 | 64.157 | 63.735 |
| 1455.91 | 63.541 | 64.008 | 63.775 |
| 1456.56 | 63.918 | 63.834 | 63.876 |
| 1456.99 | 64.166 | 63.728 | 63.947 |
| 1457.42 | 64.431 | 63.644 | 64.038 |
| 1458.08 | 64.81 | 63.55 | 64.18 |
| 1458.51 | 65.132 | 63.481 | 64.306 |
| 1458.95 | 65.381 | 63.47 | 64.426 |
| 1459.61 | 65.928 | 63.462 | 64.695 |
| 1460.05 | 66.282 | 63.492 | 64.887 |
| 1460.49 | 66.667 | 63.54 | 65.103 |
| 1460.93 | 67.076 | 63.578 | 65.327 |
| 1461.59 | 67.744 | 63.682 | 65.713 |
| 1462.03 | 68.219 | 63.801 | 66.01 |
| 1462.48 | 68.69 | 63.935 | 66.313 |
| 1462.92 | 69.244 | 64.06 | 66.652 |
| 1463.59 | 70.064 | 64.303 | 67.184 |
| 1464.04 | 70.571 | 64.449 | 67.51 |
| 1464.49 | 71.078 | 64.658 | 67.868 |
| 1464.94 | 71.646 | 64.891 | 68.268 |
| 1465.39 | 72.159 | 65.114 | 68.637 |
| 1466.07 | 72.845 | 65.55 | 69.198 |
| 1466.52 | 73.346 | 65.82 | 69.583 |
| 1466.97 | 73.683 | 66.148 | 69.915 |
| 1467.43 | 74.038 | 66.479 | 70.258 |
| 1468.11 | 74.451 | 67.005 | 70.728 |
| 1468.57 | 74.666 | 67.333 | 70.999 |
| 1469.03 | 74.787 | 67.791 | 71.289 |
| 1469.49 | 74.799 | 68.175 | 71.487 |
| 1469.95 | 74.729 | 68.62 | 71.675 |
| 1470.41 | 74.589 | 69.042 | 71.815 |
| 1471.1 | 74.215 | 69.746 | 71.981 |
| 1471.57 | 73.833 | 70.235 | 72.034 |
| 1472.03 | 73.291 | 70.726 | 72.009 |
| 1472.49 | 72.764 | 71.243 | 72.003 |
| 1472.96 | 72.087 | 71.774 | 71.931 |
| 1473.43 | 71.36 | 72.266 | 71.813 |
| 1473.9 | 70.457 | 72.777 | 71.617 |
| 1474.6 | 68.945 | 73.65 | 71.297 |
| 1475.07 | 67.899 | 74.206 | 71.052 |
| 1475.54 | 66.742 | 74.758 | 70.75 |
| 1476.01 | 65.488 | 75.262 | 70.375 |
| 1476.49 | 64.213 | 75.921 | 70.067 |
| 1476.96 | 62.878 | 76.464 | 69.671 |
| 1477.43 | 61.434 | 76.986 | 69.21 |
| 1477.91 | 59.984 | 77.578 | 68.781 |
| 1478.39 | 58.532 | 78.172 | 68.352 |
| 1479.1 | 56.334 | 79.051 | 67.693 |
| 1479.58 | 54.799 | 79.603 | 67.201 |
| 1480.06 | 53.253 | 80.129 | 66.691 |
| 1480.54 | 51.668 | 80.681 | 66.175 |
| 1481.02 | 50.221 | 81.25 | 65.735 |
| 1481.5 | 48.69 | 81.775 | 65.233 |
| 1481.99 | 47.337 | 82.28 | 64.809 |
| 1482.47 | 45.809 | 82.778 | 64.294 |
| 1482.95 | 44.497 | 83.226 | 63.862 |
| 1483.44 | 43.072 | 83.741 | 63.407 |
| 1483.92 | 41.829 | 84.157 | 62.993 |
| 1484.41 | 40.508 | 84.512 | 62.51 |
| 1484.9 | 39.3 | 84.938 | 62.119 |
| 1485.39 | 38.148 | 85.289 | 61.718 |
| 1486.12 | 36.499 | 85.808 | 61.154 |
| 1486.61 | 35.479 | 86.073 | 60.776 |
| 1487.1 | 34.521 | 86.352 | 60.436 |
| 1487.59 | 33.581 | 86.604 | 60.093 |
| 1488.09 | 32.715 | 86.824 | 59.77 |
| 1488.58 | 31.914 | 86.997 | 59.455 |
| 1489.07 | 31.162 | 87.216 | 59.189 |
| 1489.57 | 30.427 | 87.29 | 58.858 |
| 1490.06 | 29.788 | 87.38 | 58.584 |
| 1490.56 | 29.137 | 87.463 | 58.3 |
| 1491.05 | 28.577 | 87.498 | 58.038 |
| 1491.55 | 28.061 | 87.498 | 57.78 |
| 1492.05 | 27.58 | 87.447 | 57.513 |
| 1492.54 | 27.138 | 87.393 | 57.265 |
| 1493.04 | 26.733 | 87.294 | 57.014 |
| 1493.54 | 26.378 | 87.177 | 56.778 |
| 1494.04 | 26.061 | 86.979 | 56.52 |
| 1494.54 | 25.77 | 86.794 | 56.282 |
| 1495.04 | 25.529 | 86.586 | 56.057 |
| 1495.54 | 25.327 | 86.361 | 55.844 |
| 1496.05 | 25.145 | 86.124 | 55.635 |
| 1496.55 | 24.996 | 85.813 | 55.405 |
| 1497.05 | 24.881 | 85.541 | 55.211 |
| 1497.56 | 24.804 | 85.21 | 55.007 |
| 1498.06 | 24.759 | 84.826 | 54.792 |
| 1498.56 | 24.751 | 84.486 | 54.618 |
| 1499.07 | 24.771 | 84.098 | 54.434 |
| 1499.57 | 24.817 | 83.677 | 54.247 |
| 1500.08 | 24.918 | 83.279 | 54.099 |
| 1500.59 | 25.052 | 82.834 | 53.943 |
| 1501.09 | 25.21 | 82.4 | 53.805 |
| 1501.6 | 25.4 | 82.008 | 53.704 |
| 1502.11 | 25.644 | 81.491 | 53.568 |
| 1502.61 | 25.897 | 81.03 | 53.463 |
| 1503.12 | 26.2 | 80.551 | 53.376 |
| 1503.63 | 26.539 | 80.104 | 53.321 |
| 1503.88 | 26.728 | 79.871 | 53.3 |
| 1504.39 | 27.155 | 79.437 | 53.296 |
| 1504.9 | 27.592 | 78.947 | 53.269 |
| 1505.41 | 28.098 | 78.474 | 53.286 |
| 1505.92 | 28.646 | 78.002 | 53.324 |
| 1506.43 | 29.219 | 77.557 | 53.388 |
| 1506.94 | 29.803 | 77.116 | 53.46 |
| 1507.45 | 30.518 | 76.674 | 53.596 |
| 1507.96 | 31.229 | 76.234 | 53.732 |
| 1508.47 | 32.061 | 75.784 | 53.922 |
| 1508.98 | 32.866 | 75.423 | 54.145 |
| 1509.49 | 33.738 | 75.008 | 54.373 |
| 1510.0 | 34.667 | 74.643 | 54.655 |
| 1510.51 | 35.655 | 74.229 | 54.942 |
| 1511.02 | 36.713 | 73.897 | 55.305 |
| 1511.54 | 37.817 | 73.531 | 55.674 |
| 1512.05 | 38.865 | 73.222 | 56.044 |
| 1512.56 | 40.144 | 72.86 | 56.502 |
| 1513.07 | 41.385 | 72.614 | 57 |
| 1513.58 | 42.71 | 72.32 | 57.515 |
| 1514.09 | 43.953 | 72.088 | 58.021 |
| 1514.6 | 45.442 | 71.813 | 58.627 |
| 1515.12 | 46.72 | 71.581 | 59.151 |
| 1515.63 | 48.147 | 71.377 | 59.762 |
| 1515.88 | 48.837 | 71.29 | 60.064 |
| 1516.39 | 50.248 | 71.114 | 60.681 |
| 1516.91 | 51.668 | 70.944 | 61.306 |
| 1517.42 | 53.105 | 70.812 | 61.958 |
| 1517.93 | 54.456 | 70.694 | 62.575 |
| 1518.44 | 55.872 | 70.61 | 63.241 |
| 1518.95 | 57.151 | 70.497 | 63.824 |
| 1519.46 | 58.414 | 70.45 | 64.432 |
| 1519.97 | 59.618 | 70.39 | 65.004 |
| 1520.48 | 60.726 | 70.357 | 65.542 |
| 1520.99 | 61.824 | 70.334 | 66.079 |
| 1521.5 | 62.737 | 70.352 | 66.544 |
| 1522.01 | 63.639 | 70.4 | 67.02 |
| 1522.52 | 64.41 | 70.433 | 67.421 |
| 1523.03 | 65.058 | 70.467 | 67.763 |
| 1523.54 | 65.562 | 70.521 | 68.041 |
| 1524.05 | 65.929 | 70.623 | 68.276 |
| 1524.56 | 66.215 | 70.739 | 68.477 |
| 1525.07 | 66.344 | 70.832 | 68.588 |
| 1525.57 | 66.367 | 71.007 | 68.687 |
| 1526.08 | 66.249 | 71.156 | 68.703 |
| 1526.59 | 65.996 | 71.286 | 68.641 |
| 1527.1 | 65.653 | 71.45 | 68.551 |
| 1527.6 | 65.186 | 71.658 | 68.422 |
| 1528.11 | 64.539 | 71.812 | 68.175 |
| 1528.61 | 63.855 | 72.025 | 67.94 |
| 1529.12 | 63.046 | 72.215 | 67.63 |
| 1529.62 | 62.16 | 72.486 | 67.323 |
| 1529.88 | 61.656 | 72.589 | 67.122 |
| 1530.38 | 60.639 | 72.84 | 66.74 |
| 1530.88 | 59.499 | 73.1 | 66.299 |
| 1531.39 | 58.365 | 73.343 | 65.854 |
| 1531.89 | 57.142 | 73.572 | 65.357 |
| 1532.39 | 55.971 | 73.878 | 64.924 |
| 1532.9 | 54.608 | 74.167 | 64.387 |
| 1533.4 | 53.326 | 74.428 | 63.877 |
| 1533.9 | 52.007 | 74.68 | 63.344 |
| 1534.4 | 50.749 | 74.959 | 62.854 |
| 1534.9 | 49.399 | 75.247 | 62.323 |
| 1535.4 | 48.213 | 75.55 | 61.882 |
| 1535.89 | 46.931 | 75.822 | 61.377 |
| 1536.39 | 45.793 | 76.101 | 60.947 |
| 1536.89 | 44.539 | 76.337 | 60.438 |
| 1537.39 | 43.427 | 76.675 | 60.051 |
| 1537.88 | 42.326 | 76.946 | 59.636 |
| 1538.38 | 41.322 | 77.205 | 59.263 |
| 1539.12 | 39.839 | 77.581 | 58.71 |
| 1539.61 | 38.913 | 77.879 | 58.396 |
| 1540.11 | 38.057 | 78.125 | 58.091 |
| 1540.6 | 37.25 | 78.375 | 57.813 |
| 1541.09 | 36.467 | 78.637 | 57.552 |
| 1541.58 | 35.773 | 78.861 | 57.317 |
| 1542.07 | 35.113 | 79.088 | 57.101 |
| 1542.56 | 34.489 | 79.308 | 56.898 |
| 1543.05 | 33.916 | 79.56 | 56.738 |
| 1543.54 | 33.386 | 79.739 | 56.563 |
| 1544.02 | 32.886 | 79.982 | 56.434 |
| 1544.51 | 32.464 | 80.161 | 56.312 |
| 1545.0 | 32.052 | 80.319 | 56.186 |
| 1545.48 | 31.7 | 80.476 | 56.088 |
| 1545.97 | 31.373 | 80.638 | 56.006 |
| 1546.45 | 31.103 | 80.813 | 55.958 |
| 1546.93 | 30.839 | 80.965 | 55.902 |
| 1547.41 | 30.63 | 81.107 | 55.869 |
| 1547.89 | 30.442 | 81.201 | 55.822 |
| 1548.61 | 30.265 | 81.363 | 55.814 |
| 1549.09 | 30.144 | 81.467 | 55.806 |
| 1549.57 | 30.107 | 81.568 | 55.837 |
| 1550.05 | 30.064 | 81.654 | 55.859 |
| 1550.52 | 30.053 | 81.717 | 55.885 |
| 1551.0 | 30.072 | 81.766 | 55.919 |
| 1551.47 | 30.15 | 81.839 | 55.994 |
| 1551.95 | 30.213 | 81.89 | 56.051 |
| 1552.42 | 30.351 | 81.92 | 56.135 |
| 1552.89 | 30.48 | 81.956 | 56.218 |
| 1553.6 | 30.757 | 81.964 | 56.36 |
| 1554.07 | 30.962 | 82.003 | 56.483 |
| 1554.53 | 31.2 | 82.025 | 56.613 |
| 1555.0 | 31.467 | 82.035 | 56.751 |
| 1555.47 | 31.779 | 82.037 | 56.908 |
| 1555.93 | 32.092 | 82.049 | 57.07 |
| 1556.4 | 32.445 | 82.017 | 57.231 |
| 1557.09 | 33.002 | 82.021 | 57.512 |
| 1557.56 | 33.363 | 81.988 | 57.676 |
| 1558.02 | 33.819 | 81.938 | 57.879 |
| 1558.48 | 34.294 | 81.941 | 58.117 |
| 1558.94 | 34.795 | 81.918 | 58.357 |
| 1559.4 | 35.256 | 81.88 | 58.568 |
| 1560.08 | 36.108 | 81.839 | 58.974 |
| 1560.54 | 36.644 | 81.827 | 59.236 |
| 1560.99 | 37.223 | 81.806 | 59.515 |
| 1561.45 | 37.871 | 81.77 | 59.821 |
| 1561.9 | 38.459 | 81.778 | 60.119 |
| 1562.58 | 39.44 | 81.718 | 60.579 |
| 1563.03 | 40.055 | 81.687 | 60.871 |
| 1563.48 | 40.784 | 81.658 | 61.221 |
| 1563.93 | 41.41 | 81.656 | 61.533 |
| 1564.6 | 42.525 | 81.619 | 62.072 |
| 1565.05 | 43.241 | 81.603 | 62.422 |
| 1565.49 | 43.973 | 81.564 | 62.768 |
| 1565.94 | 44.726 | 81.558 | 63.142 |
| 1566.6 | 45.828 | 81.579 | 63.704 |
| 1567.04 | 46.616 | 81.589 | 64.102 |
| 1567.49 | 47.358 | 81.581 | 64.47 |
| 1567.93 | 48.132 | 81.582 | 64.857 |
| 1568.58 | 49.225 | 81.59 | 65.408 |
| 1569.02 | 49.973 | 81.614 | 65.794 |
| 1569.46 | 50.686 | 81.636 | 66.161 |
| 1570.11 | 51.739 | 81.694 | 66.716 |
| 1570.55 | 52.529 | 81.717 | 67.123 |
| 1570.98 | 53.151 | 81.742 | 67.447 |
| 1571.41 | 53.837 | 81.745 | 67.791 |
| 1572.06 | 54.804 | 81.789 | 68.296 |
| 1572.49 | 55.496 | 81.861 | 68.678 |
| 1572.92 | 56.036 | 81.906 | 68.971 |
| 1573.56 | 56.899 | 81.945 | 69.422 |
| 1573.99 | 57.446 | 82.028 | 69.737 |
| 1574.42 | 57.923 | 82.066 | 69.994 |
| 1575.05 | 58.692 | 82.138 | 70.415 |
| 1575.48 | 59.049 | 82.18 | 70.615 |
| 1575.9 | 59.481 | 82.261 | 70.871 |
| 1576.54 | 60.001 | 82.349 | 71.175 |
| 1576.96 | 60.309 | 82.45 | 71.38 |
| 1577.59 | 60.702 | 82.513 | 71.607 |
| 1578.01 | 60.916 | 82.597 | 71.757 |
| 1578.42 | 61.088 | 82.638 | 71.863 |
| 1579.05 | 61.306 | 82.809 | 72.058 |
| 1579.47 | 61.431 | 82.883 | 72.157 |
| 1580.09 | 61.506 | 82.962 | 72.234 |
| 1580.5 | 61.492 | 83.028 | 72.26 |
| 1580.92 | 61.458 | 83.091 | 72.274 |
| 1581.53 | 61.356 | 83.22 | 72.288 |
| 1581.95 | 61.264 | 83.303 | 72.283 |
| 1582.56 | 61.129 | 83.391 | 72.26 |
| 1582.97 | 60.924 | 83.463 | 72.193 |
| 1583.58 | 60.638 | 83.528 | 72.083 |
| 1583.99 | 60.402 | 83.589 | 71.996 |
| 1584.6 | 60.03 | 83.667 | 71.848 |
| 1585.01 | 59.766 | 83.72 | 71.743 |
| 1585.41 | 59.436 | 83.759 | 71.598 |
| 1586.02 | 59.018 | 83.885 | 71.451 |
| 1586.42 | 58.675 | 83.898 | 71.286 |
| 1587.03 | 58.2 | 83.924 | 71.062 |
| 1587.43 | 57.86 | 83.941 | 70.9 |
| 1588.03 | 57.348 | 84.005 | 70.677 |
| 1588.43 | 57.022 | 84.007 | 70.514 |
| 1589.03 | 56.438 | 84.008 | 70.223 |
| 1589.43 | 56.135 | 83.995 | 70.065 |
| 1590.03 | 55.621 | 84.014 | 69.818 |
| 1590.43 | 55.258 | 84.01 | 69.634 |
| 1591.02 | 54.742 | 83.948 | 69.345 |
| 1591.42 | 54.444 | 83.888 | 69.166 |
| 1592.01 | 53.957 | 83.788 | 68.873 |
| 1592.41 | 53.709 | 83.753 | 68.731 |
| 1593.0 | 53.284 | 83.638 | 68.461 |
| 1593.59 | 52.901 | 83.509 | 68.205 |
| 1593.98 | 52.696 | 83.439 | 68.068 |
| 1594.57 | 52.328 | 83.273 | 67.8 |
| 1594.97 | 52.136 | 83.133 | 67.635 |
| 1595.56 | 51.856 | 82.922 | 67.389 |
| 1595.95 | 51.705 | 82.795 | 67.25 |
| 1596.53 | 51.509 | 82.551 | 67.03 |
| 1596.93 | 51.394 | 82.415 | 66.905 |
| 1597.51 | 51.263 | 82.122 | 66.692 |
| 1598.1 | 51.186 | 81.839 | 66.513 |
| 1598.49 | 51.15 | 81.633 | 66.391 |
| 1599.07 | 51.128 | 81.284 | 66.206 |
| 1599.46 | 51.151 | 81.027 | 66.089 |
| 1600.04 | 51.228 | 80.691 | 65.96 |
| 1600.43 | 51.282 | 80.43 | 65.856 |
| 1601.02 | 51.378 | 80.061 | 65.72 |
| 1601.6 | 51.553 | 79.6 | 65.576 |
| 1601.99 | 51.668 | 79.307 | 65.488 |
| 1602.57 | 51.897 | 78.822 | 65.36 |
| 1602.96 | 52.099 | 78.508 | 65.303 |
| 1603.54 | 52.386 | 78.014 | 65.2 |
| 1603.93 | 52.638 | 77.72 | 65.179 |
| 1604.51 | 52.969 | 77.147 | 65.058 |
| 1605.09 | 53.309 | 76.589 | 64.949 |
| 1605.48 | 53.569 | 76.229 | 64.899 |
| 1606.06 | 53.971 | 75.657 | 64.814 |
| 1606.45 | 54.218 | 75.243 | 64.73 |
| 1607.03 | 54.687 | 74.653 | 64.67 |
| 1607.42 | 54.974 | 74.26 | 64.617 |
| 1608.0 | 55.398 | 73.604 | 64.501 |
| 1608.58 | 55.862 | 72.974 | 64.418 |
| 1608.97 | 56.157 | 72.488 | 64.322 |
| 1609.56 | 56.547 | 71.861 | 64.204 |
| 1609.95 | 56.855 | 71.423 | 64.139 |
| 1610.53 | 57.267 | 70.739 | 64.003 |
| 1610.92 | 57.508 | 70.296 | 63.902 |
| 1611.51 | 57.844 | 69.565 | 63.704 |
| 1612.09 | 58.144 | 68.854 | 63.499 |
| 1612.48 | 58.312 | 68.379 | 63.346 |
| 1613.07 | 58.543 | 67.651 | 63.097 |
| 1613.46 | 58.694 | 67.158 | 62.926 |
| 1614.05 | 58.86 | 66.425 | 62.642 |
| 1614.44 | 58.886 | 65.916 | 62.401 |
| 1615.03 | 58.887 | 65.179 | 62.033 |
| 1615.42 | 58.857 | 64.692 | 61.775 |
| 1616.01 | 58.769 | 63.923 | 61.346 |
| 1616.41 | 58.653 | 63.438 | 61.045 |
| 1617.0 | 58.414 | 62.651 | 60.532 |
| 1617.6 | 58.067 | 61.876 | 59.971 |
| 1617.99 | 57.803 | 61.383 | 59.593 |
| 1618.59 | 57.349 | 60.567 | 58.958 |
| 1618.98 | 57.001 | 60.059 | 58.53 |
| 1619.58 | 56.342 | 59.271 | 57.806 |
| 1619.98 | 55.902 | 58.746 | 57.324 |
| 1620.58 | 55.125 | 57.997 | 56.561 |
| 1620.98 | 54.615 | 57.505 | 56.06 |
| 1621.58 | 53.671 | 56.708 | 55.19 |
| 1621.98 | 53.028 | 56.215 | 54.621 |
| 1622.59 | 51.997 | 55.381 | 53.689 |
| 1622.99 | 51.315 | 54.889 | 53.102 |
| 1623.6 | 50.13 | 54.132 | 52.131 |
| 1624.0 | 49.39 | 53.619 | 51.504 |
| 1624.41 | 48.535 | 53.153 | 50.844 |
| 1625.02 | 47.294 | 52.374 | 49.834 |
| 1625.42 | 46.472 | 51.849 | 49.161 |
| 1626.04 | 45.083 | 51.097 | 48.09 |
| 1626.45 | 44.216 | 50.613 | 47.415 |
| 1627.06 | 42.886 | 49.88 | 46.383 |
| 1627.47 | 41.933 | 49.375 | 45.654 |
| 1628.09 | 40.583 | 48.635 | 44.609 |
| 1628.5 | 39.634 | 48.163 | 43.899 |
| 1628.92 | 38.725 | 47.663 | 43.194 |
| 1629.54 | 37.378 | 46.966 | 42.172 |
| 1629.95 | 36.436 | 46.471 | 41.453 |
| 1630.58 | 35.115 | 45.754 | 40.434 |
| 1631.0 | 34.248 | 45.313 | 39.781 |
| 1631.41 | 33.387 | 44.823 | 39.105 |
| 1632.04 | 32.14 | 44.088 | 38.114 |
| 1632.46 | 31.266 | 43.63 | 37.448 |
| 1633.1 | 30.061 | 42.913 | 36.487 |
| 1633.52 | 29.304 | 42.478 | 35.891 |
| 1633.94 | 28.548 | 42.009 | 35.279 |
| 1634.58 | 27.471 | 41.36 | 34.416 |
| 1635.01 | 26.694 | 40.865 | 33.78 |
| 1635.43 | 26.016 | 40.455 | 33.235 |
| 1636.07 | 24.992 | 39.808 | 32.4 |
| 1636.5 | 24.341 | 39.327 | 31.834 |
| 1636.93 | 23.731 | 38.922 | 31.326 |
| 1637.58 | 22.803 | 38.258 | 30.53 |
| 1638.01 | 22.293 | 37.831 | 30.062 |
| 1638.44 | 21.698 | 37.397 | 29.547 |
| 1639.09 | 20.919 | 36.758 | 28.839 |
| 1639.53 | 20.407 | 36.343 | 28.375 |
| 1639.97 | 19.909 | 35.908 | 27.909 |
| 1640.4 | 19.469 | 35.519 | 27.494 |
| 1641.06 | 18.761 | 34.907 | 26.834 |
| 1641.5 | 18.358 | 34.515 | 26.437 |
| 1641.94 | 17.929 | 34.095 | 26.012 |
| 1642.6 | 17.339 | 33.49 | 25.415 |
| 1643.05 | 16.951 | 33.11 | 25.03 |
| 1643.49 | 16.57 | 32.696 | 24.633 |
| 1643.93 | 16.24 | 32.328 | 24.284 |
| 1644.6 | 15.746 | 31.739 | 23.743 |
| 1645.05 | 15.438 | 31.384 | 23.411 |
| 1645.5 | 15.112 | 31.006 | 23.059 |
| 1645.95 | 14.828 | 30.635 | 22.731 |
| 1646.4 | 14.53 | 30.251 | 22.39 |
| 1647.07 | 14.12 | 29.67 | 21.895 |
| 1647.52 | 13.875 | 29.324 | 21.599 |
| 1647.98 | 13.637 | 28.98 | 21.309 |
| 1648.43 | 13.407 | 28.665 | 21.036 |
| 1649.11 | 13.068 | 28.124 | 20.596 |
| 1649.57 | 12.852 | 27.795 | 20.323 |
| 1650.03 | 12.651 | 27.433 | 20.042 |